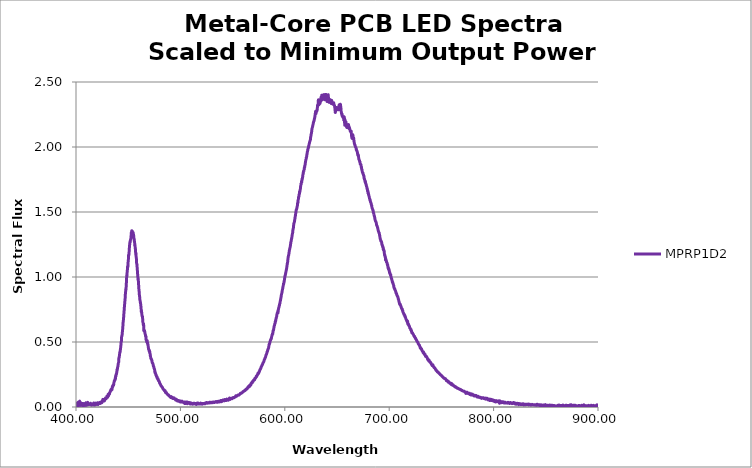
| Category | MPRP1D2 |
|---|---|
| 199.975 | 0 |
| 200.177 | 0 |
| 200.378 | 0 |
| 200.58 | 0 |
| 200.781 | 0 |
| 200.983 | 0 |
| 201.184 | 0 |
| 201.386 | 0 |
| 201.588 | 0 |
| 201.789 | 0 |
| 201.991 | 0 |
| 202.193 | 0 |
| 202.394 | 0 |
| 202.596 | 0 |
| 202.798 | 0 |
| 202.999 | 0 |
| 203.201 | 0 |
| 203.403 | 0 |
| 203.605 | 0 |
| 203.806 | 0 |
| 204.008 | 0 |
| 204.21 | 0 |
| 204.412 | 0 |
| 204.614 | 0 |
| 204.816 | 0 |
| 205.018 | 0 |
| 205.219 | 0 |
| 205.421 | 0 |
| 205.623 | 0 |
| 205.825 | 0 |
| 206.027 | 0 |
| 206.229 | 0 |
| 206.431 | 0 |
| 206.633 | 0 |
| 206.836 | 0 |
| 207.038 | 0 |
| 207.24 | 0 |
| 207.442 | 0 |
| 207.644 | 0 |
| 207.846 | 0 |
| 208.048 | 0 |
| 208.251 | 0 |
| 208.453 | 0 |
| 208.655 | 0 |
| 208.857 | 0 |
| 209.06 | 0 |
| 209.262 | 0 |
| 209.464 | 0 |
| 209.667 | 0 |
| 209.869 | 0 |
| 210.071 | 0 |
| 210.274 | 0 |
| 210.476 | 0 |
| 210.678 | 0 |
| 210.881 | 0 |
| 211.083 | 0 |
| 211.286 | 0 |
| 211.488 | 0 |
| 211.691 | 0 |
| 211.893 | 0 |
| 212.096 | 0 |
| 212.299 | 0 |
| 212.501 | 0 |
| 212.704 | 0 |
| 212.906 | 0 |
| 213.109 | 0 |
| 213.312 | 0 |
| 213.514 | 0 |
| 213.717 | 0 |
| 213.92 | 0 |
| 214.123 | 0 |
| 214.325 | 0 |
| 214.528 | 0 |
| 214.731 | 0 |
| 214.934 | 0 |
| 215.137 | 0 |
| 215.339 | 0 |
| 215.542 | 0 |
| 215.745 | 0 |
| 215.948 | 0 |
| 216.151 | 0 |
| 216.354 | 0 |
| 216.557 | 0 |
| 216.76 | 0 |
| 216.963 | 0 |
| 217.166 | 0 |
| 217.369 | 0 |
| 217.572 | 0 |
| 217.775 | 0 |
| 217.978 | 0 |
| 218.181 | 0 |
| 218.385 | 0 |
| 218.588 | 0 |
| 218.791 | 0 |
| 218.994 | 0 |
| 219.197 | 0 |
| 219.4 | 0 |
| 219.604 | 0 |
| 219.807 | 0 |
| 220.01 | 0 |
| 220.214 | 0 |
| 220.417 | 0 |
| 220.62 | 0 |
| 220.824 | 0 |
| 221.027 | 0 |
| 221.23 | 0 |
| 221.434 | 0 |
| 221.637 | 0 |
| 221.841 | 0 |
| 222.044 | 0 |
| 222.248 | 0 |
| 222.451 | 0 |
| 222.655 | 0 |
| 222.858 | 0 |
| 223.062 | 0 |
| 223.265 | 0 |
| 223.469 | 0 |
| 223.672 | 0 |
| 223.876 | 0 |
| 224.08 | 0 |
| 224.283 | 0 |
| 224.487 | 0 |
| 224.691 | 0 |
| 224.894 | 0 |
| 225.098 | 0 |
| 225.302 | 0 |
| 225.506 | 0 |
| 225.71 | 0 |
| 225.913 | 0 |
| 226.117 | 0 |
| 226.321 | 0 |
| 226.525 | 0 |
| 226.729 | 0 |
| 226.933 | 0 |
| 227.137 | 0 |
| 227.341 | 0 |
| 227.544 | 0 |
| 227.748 | 0 |
| 227.952 | 0 |
| 228.156 | 0 |
| 228.361 | 0 |
| 228.565 | 0 |
| 228.769 | 0 |
| 228.973 | 0 |
| 229.177 | 0 |
| 229.381 | 0 |
| 229.585 | 0 |
| 229.789 | 0 |
| 229.993 | 0 |
| 230.198 | 0 |
| 230.402 | 0 |
| 230.606 | 0 |
| 230.81 | 0 |
| 231.015 | 0 |
| 231.219 | 0 |
| 231.423 | 0 |
| 231.627 | 0 |
| 231.832 | 0 |
| 232.036 | 0 |
| 232.241 | 0 |
| 232.445 | 0 |
| 232.649 | 0 |
| 232.854 | 0 |
| 233.058 | 0 |
| 233.263 | 0 |
| 233.467 | 0 |
| 233.672 | 0 |
| 233.876 | 0 |
| 234.081 | 0 |
| 234.285 | 0 |
| 234.49 | 0 |
| 234.695 | 0 |
| 234.899 | 0 |
| 235.104 | 0 |
| 235.308 | 0 |
| 235.513 | 0 |
| 235.718 | 0 |
| 235.922 | 0 |
| 236.127 | 0 |
| 236.332 | 0 |
| 236.537 | 0 |
| 236.741 | 0 |
| 236.946 | 0 |
| 237.151 | 0 |
| 237.356 | 0 |
| 237.561 | 0 |
| 237.766 | 0 |
| 237.971 | 0 |
| 238.175 | 0 |
| 238.38 | 0 |
| 238.585 | 0 |
| 238.79 | 0 |
| 238.995 | 0 |
| 239.2 | 0 |
| 239.405 | 0 |
| 239.61 | 0 |
| 239.815 | 0 |
| 240.02 | 0 |
| 240.225 | 0 |
| 240.431 | 0 |
| 240.636 | 0 |
| 240.841 | 0 |
| 241.046 | 0 |
| 241.251 | 0 |
| 241.456 | 0 |
| 241.662 | 0 |
| 241.867 | 0 |
| 242.072 | 0 |
| 242.277 | 0 |
| 242.483 | 0 |
| 242.688 | 0 |
| 242.893 | 0 |
| 243.098 | 0 |
| 243.304 | 0 |
| 243.509 | 0 |
| 243.715 | 0 |
| 243.92 | 0 |
| 244.125 | 0 |
| 244.331 | 0 |
| 244.536 | 0 |
| 244.742 | 0 |
| 244.947 | 0 |
| 245.153 | 0 |
| 245.358 | 0 |
| 245.564 | 0 |
| 245.769 | 0 |
| 245.975 | 0 |
| 246.181 | 0 |
| 246.386 | 0 |
| 246.592 | 0 |
| 246.798 | 0 |
| 247.003 | 0 |
| 247.209 | 0 |
| 247.415 | 0 |
| 247.62 | 0 |
| 247.826 | 0 |
| 248.032 | 0 |
| 248.238 | 0 |
| 248.443 | 0 |
| 248.649 | 0 |
| 248.855 | 0 |
| 249.061 | 0 |
| 249.267 | 0 |
| 249.473 | 0 |
| 249.679 | 0 |
| 249.885 | 0 |
| 250.091 | 0 |
| 250.297 | 0 |
| 250.502 | 0 |
| 250.708 | 0 |
| 250.914 | 0 |
| 251.121 | 0 |
| 251.327 | 0 |
| 251.533 | 0 |
| 251.739 | 0 |
| 251.945 | 0 |
| 252.151 | 0 |
| 252.357 | 0 |
| 252.563 | 0 |
| 252.769 | 0 |
| 252.976 | 0 |
| 253.182 | 0 |
| 253.388 | 0 |
| 253.594 | 0 |
| 253.801 | 0 |
| 254.007 | 0 |
| 254.213 | 0 |
| 254.419 | 0 |
| 254.626 | 0 |
| 254.832 | 0 |
| 255.039 | 0 |
| 255.245 | 0 |
| 255.451 | 0 |
| 255.658 | 0 |
| 255.864 | 0 |
| 256.071 | 0 |
| 256.277 | 0 |
| 256.484 | 0 |
| 256.69 | 0 |
| 256.897 | 0 |
| 257.103 | 0 |
| 257.31 | 0 |
| 257.516 | 0 |
| 257.723 | 0 |
| 257.93 | 0 |
| 258.136 | 0 |
| 258.343 | 0 |
| 258.55 | 0 |
| 258.756 | 0 |
| 258.963 | 0 |
| 259.17 | 0 |
| 259.376 | 0 |
| 259.583 | 0 |
| 259.79 | 0 |
| 259.997 | 0 |
| 260.204 | 0 |
| 260.41 | 0 |
| 260.617 | 0 |
| 260.824 | 0 |
| 261.031 | 0 |
| 261.238 | 0 |
| 261.445 | 0 |
| 261.652 | 0 |
| 261.859 | 0 |
| 262.066 | 0 |
| 262.273 | 0 |
| 262.48 | 0 |
| 262.687 | 0 |
| 262.894 | 0 |
| 263.101 | 0 |
| 263.308 | 0 |
| 263.515 | 0 |
| 263.722 | 0 |
| 263.929 | 0 |
| 264.136 | 0 |
| 264.343 | 0 |
| 264.551 | 0 |
| 264.758 | 0 |
| 264.965 | 0 |
| 265.172 | 0 |
| 265.38 | 0 |
| 265.587 | 0 |
| 265.794 | 0 |
| 266.001 | 0 |
| 266.209 | 0 |
| 266.416 | 0 |
| 266.623 | 0 |
| 266.831 | 0 |
| 267.038 | 0 |
| 267.246 | 0 |
| 267.453 | 0 |
| 267.66 | 0 |
| 267.868 | 0 |
| 268.075 | 0 |
| 268.283 | 0 |
| 268.49 | 0 |
| 268.698 | 0 |
| 268.905 | 0 |
| 269.113 | 0 |
| 269.321 | 0 |
| 269.528 | 0 |
| 269.736 | 0 |
| 269.943 | 0 |
| 270.151 | 0 |
| 270.359 | 0 |
| 270.567 | 0 |
| 270.774 | 0 |
| 270.982 | 0 |
| 271.19 | 0 |
| 271.397 | 0 |
| 271.605 | 0 |
| 271.813 | 0 |
| 272.021 | 0 |
| 272.229 | 0 |
| 272.436 | 0 |
| 272.644 | 0 |
| 272.852 | 0 |
| 273.06 | 0 |
| 273.268 | 0 |
| 273.476 | 0 |
| 273.684 | 0 |
| 273.892 | 0 |
| 274.1 | 0 |
| 274.308 | 0 |
| 274.516 | 0 |
| 274.724 | 0 |
| 274.932 | 0 |
| 275.14 | 0 |
| 275.348 | 0 |
| 275.556 | 0 |
| 275.764 | 0 |
| 275.973 | 0 |
| 276.181 | 0 |
| 276.389 | 0 |
| 276.597 | 0 |
| 276.805 | 0 |
| 277.013 | 0 |
| 277.222 | 0 |
| 277.43 | 0 |
| 277.638 | 0 |
| 277.847 | 0 |
| 278.055 | 0 |
| 278.263 | 0 |
| 278.472 | 0 |
| 278.68 | 0 |
| 278.888 | 0 |
| 279.097 | 0 |
| 279.305 | 0 |
| 279.514 | 0 |
| 279.722 | 0 |
| 279.93 | 0 |
| 280.139 | 0 |
| 280.347 | 0 |
| 280.556 | 0 |
| 280.764 | 0 |
| 280.973 | 0 |
| 281.182 | 0 |
| 281.39 | 0 |
| 281.599 | 0 |
| 281.807 | 0 |
| 282.016 | 0 |
| 282.225 | 0 |
| 282.433 | 0 |
| 282.642 | 0 |
| 282.851 | 0 |
| 283.06 | 0 |
| 283.268 | 0 |
| 283.477 | 0 |
| 283.686 | 0 |
| 283.895 | 0 |
| 284.103 | 0 |
| 284.312 | 0 |
| 284.521 | 0 |
| 284.73 | 0 |
| 284.939 | 0 |
| 285.148 | 0 |
| 285.357 | 0 |
| 285.566 | 0 |
| 285.775 | 0 |
| 285.984 | 0 |
| 286.193 | 0 |
| 286.402 | 0 |
| 286.611 | 0 |
| 286.82 | 0 |
| 287.029 | 0 |
| 287.238 | 0 |
| 287.447 | 0 |
| 287.656 | 0 |
| 287.865 | 0 |
| 288.074 | 0 |
| 288.283 | 0 |
| 288.492 | 0 |
| 288.702 | 0 |
| 288.911 | 0 |
| 289.12 | 0 |
| 289.329 | 0 |
| 289.539 | 0 |
| 289.748 | 0 |
| 289.957 | 0 |
| 290.166 | 0 |
| 290.376 | 0 |
| 290.585 | 0 |
| 290.795 | 0 |
| 291.004 | 0 |
| 291.213 | 0 |
| 291.423 | 0 |
| 291.632 | 0 |
| 291.842 | 0 |
| 292.051 | 0 |
| 292.26 | 0 |
| 292.47 | 0 |
| 292.68 | 0 |
| 292.889 | 0 |
| 293.099 | 0 |
| 293.308 | 0 |
| 293.518 | 0 |
| 293.727 | 0 |
| 293.937 | 0 |
| 294.147 | 0 |
| 294.356 | 0 |
| 294.566 | 0 |
| 294.776 | 0 |
| 294.985 | 0 |
| 295.195 | 0 |
| 295.405 | 0 |
| 295.614 | 0 |
| 295.824 | 0 |
| 296.034 | 0 |
| 296.244 | 0 |
| 296.454 | 0 |
| 296.663 | 0 |
| 296.873 | 0 |
| 297.083 | 0 |
| 297.293 | 0 |
| 297.503 | 0 |
| 297.713 | 0 |
| 297.923 | 0 |
| 298.133 | 0 |
| 298.343 | 0 |
| 298.553 | 0 |
| 298.763 | 0 |
| 298.973 | 0 |
| 299.183 | 0 |
| 299.393 | 0 |
| 299.603 | 0 |
| 299.813 | 0 |
| 300.023 | 0 |
| 300.233 | 0 |
| 300.443 | 0 |
| 300.654 | 0 |
| 300.864 | 0 |
| 301.074 | 0 |
| 301.284 | 0 |
| 301.494 | 0 |
| 301.705 | 0 |
| 301.915 | 0 |
| 302.125 | 0 |
| 302.335 | 0 |
| 302.546 | 0 |
| 302.756 | 0 |
| 302.966 | 0 |
| 303.177 | 0 |
| 303.387 | 0 |
| 303.598 | 0 |
| 303.808 | 0 |
| 304.018 | 0 |
| 304.229 | 0 |
| 304.439 | 0 |
| 304.65 | 0 |
| 304.86 | 0 |
| 305.071 | 0 |
| 305.281 | 0 |
| 305.492 | 0 |
| 305.702 | 0 |
| 305.913 | 0 |
| 306.124 | 0 |
| 306.334 | 0 |
| 306.545 | 0 |
| 306.755 | 0 |
| 306.966 | 0 |
| 307.177 | 0 |
| 307.387 | 0 |
| 307.598 | 0 |
| 307.809 | 0 |
| 308.02 | 0 |
| 308.23 | 0 |
| 308.441 | 0 |
| 308.652 | 0 |
| 308.863 | 0 |
| 309.074 | 0 |
| 309.284 | 0 |
| 309.495 | 0 |
| 309.706 | 0 |
| 309.917 | 0 |
| 310.128 | 0 |
| 310.339 | 0 |
| 310.55 | 0 |
| 310.761 | 0 |
| 310.972 | 0 |
| 311.183 | 0 |
| 311.394 | 0 |
| 311.605 | 0 |
| 311.816 | 0 |
| 312.027 | 0 |
| 312.238 | 0 |
| 312.449 | 0 |
| 312.66 | 0 |
| 312.871 | 0 |
| 313.083 | 0 |
| 313.294 | 0 |
| 313.505 | 0 |
| 313.716 | 0 |
| 313.927 | 0 |
| 314.139 | 0 |
| 314.35 | 0 |
| 314.561 | 0 |
| 314.772 | 0 |
| 314.984 | 0 |
| 315.195 | 0 |
| 315.406 | 0 |
| 315.618 | 0 |
| 315.829 | 0 |
| 316.04 | 0 |
| 316.252 | 0 |
| 316.463 | 0 |
| 316.675 | 0 |
| 316.886 | 0 |
| 317.097 | 0 |
| 317.309 | 0 |
| 317.52 | 0 |
| 317.732 | 0 |
| 317.943 | 0 |
| 318.155 | 0 |
| 318.367 | 0 |
| 318.578 | 0 |
| 318.79 | 0 |
| 319.001 | 0 |
| 319.213 | 0 |
| 319.425 | 0 |
| 319.636 | 0 |
| 319.848 | 0 |
| 320.06 | 0 |
| 320.271 | 0 |
| 320.483 | 0 |
| 320.695 | 0 |
| 320.907 | 0 |
| 321.118 | 0 |
| 321.33 | 0 |
| 321.542 | 0 |
| 321.754 | 0 |
| 321.966 | 0 |
| 322.177 | 0 |
| 322.389 | 0 |
| 322.601 | 0 |
| 322.813 | 0 |
| 323.025 | 0 |
| 323.237 | 0 |
| 323.449 | 0 |
| 323.661 | 0 |
| 323.873 | 0 |
| 324.085 | 0 |
| 324.297 | 0 |
| 324.509 | 0 |
| 324.721 | 0 |
| 324.933 | 0 |
| 325.145 | 0 |
| 325.357 | 0 |
| 325.569 | 0 |
| 325.781 | 0 |
| 325.994 | 0 |
| 326.206 | 0 |
| 326.418 | 0 |
| 326.63 | 0 |
| 326.842 | 0 |
| 327.055 | 0 |
| 327.267 | 0 |
| 327.479 | 0 |
| 327.691 | 0 |
| 327.904 | 0 |
| 328.116 | 0 |
| 328.328 | 0 |
| 328.541 | 0 |
| 328.753 | 0 |
| 328.965 | 0 |
| 329.178 | 0 |
| 329.39 | 0 |
| 329.603 | 0 |
| 329.815 | 0 |
| 330.028 | 0 |
| 330.24 | 0 |
| 330.453 | 0 |
| 330.665 | 0 |
| 330.878 | 0 |
| 331.09 | 0 |
| 331.303 | 0 |
| 331.515 | 0 |
| 331.728 | 0 |
| 331.94 | 0 |
| 332.153 | 0 |
| 332.366 | 0 |
| 332.578 | 0 |
| 332.791 | 0 |
| 333.004 | 0 |
| 333.216 | 0 |
| 333.429 | 0 |
| 333.642 | 0 |
| 333.855 | 0 |
| 334.067 | 0 |
| 334.28 | 0 |
| 334.493 | 0 |
| 334.706 | 0 |
| 334.919 | 0 |
| 335.132 | 0 |
| 335.344 | 0 |
| 335.557 | 0 |
| 335.77 | 0 |
| 335.983 | 0 |
| 336.196 | 0 |
| 336.409 | 0 |
| 336.622 | 0 |
| 336.835 | 0 |
| 337.048 | 0 |
| 337.261 | 0 |
| 337.474 | 0 |
| 337.687 | 0 |
| 337.9 | 0 |
| 338.113 | 0 |
| 338.326 | 0 |
| 338.539 | 0 |
| 338.752 | 0 |
| 338.966 | 0 |
| 339.179 | 0 |
| 339.392 | 0 |
| 339.605 | 0 |
| 339.818 | 0 |
| 340.032 | 0 |
| 340.245 | 0 |
| 340.458 | 0 |
| 340.671 | 0 |
| 340.885 | 0 |
| 341.098 | 0 |
| 341.311 | 0 |
| 341.525 | 0 |
| 341.738 | 0 |
| 341.951 | 0 |
| 342.165 | 0 |
| 342.378 | 0 |
| 342.591 | 0 |
| 342.805 | 0 |
| 343.018 | 0 |
| 343.232 | 0 |
| 343.445 | 0 |
| 343.659 | 0 |
| 343.872 | 0 |
| 344.086 | 0 |
| 344.299 | 0 |
| 344.513 | 0 |
| 344.727 | 0 |
| 344.94 | 0 |
| 345.154 | 0 |
| 345.367 | 0 |
| 345.581 | 0 |
| 345.795 | 0 |
| 346.008 | 0 |
| 346.222 | 0 |
| 346.436 | 0 |
| 346.649 | 0 |
| 346.863 | 0 |
| 347.077 | 0 |
| 347.291 | 0 |
| 347.504 | 0 |
| 347.718 | 0 |
| 347.932 | 0 |
| 348.146 | 0 |
| 348.36 | 0 |
| 348.574 | 0 |
| 348.787 | 0 |
| 349.001 | 0 |
| 349.215 | 0 |
| 349.429 | 0 |
| 349.643 | 0 |
| 349.857 | 0 |
| 350.071 | 0 |
| 350.285 | 0 |
| 350.499 | 0 |
| 350.713 | 0 |
| 350.927 | 0 |
| 351.141 | 0 |
| 351.355 | 0 |
| 351.569 | 0 |
| 351.783 | 0 |
| 351.998 | 0 |
| 352.212 | 0 |
| 352.426 | 0 |
| 352.64 | 0 |
| 352.854 | 0 |
| 353.068 | 0 |
| 353.283 | 0 |
| 353.497 | 0 |
| 353.711 | 0 |
| 353.925 | 0 |
| 354.14 | 0 |
| 354.354 | 0 |
| 354.568 | 0 |
| 354.783 | 0 |
| 354.997 | 0 |
| 355.211 | 0 |
| 355.426 | 0 |
| 355.64 | 0 |
| 355.854 | 0 |
| 356.069 | 0 |
| 356.283 | 0 |
| 356.498 | 0 |
| 356.712 | 0 |
| 356.927 | 0 |
| 357.141 | 0 |
| 357.356 | 0 |
| 357.57 | 0 |
| 357.785 | 0 |
| 357.999 | 0 |
| 358.214 | 0 |
| 358.429 | 0 |
| 358.643 | 0 |
| 358.858 | 0 |
| 359.072 | 0 |
| 359.287 | 0 |
| 359.502 | 0 |
| 359.716 | 0 |
| 359.931 | 0 |
| 360.146 | 0 |
| 360.361 | 0 |
| 360.575 | 0 |
| 360.79 | 0 |
| 361.005 | 0 |
| 361.22 | 0 |
| 361.434 | 0 |
| 361.649 | 0 |
| 361.864 | 0 |
| 362.079 | 0 |
| 362.294 | 0 |
| 362.509 | 0 |
| 362.724 | 0 |
| 362.939 | 0 |
| 363.154 | 0 |
| 363.369 | 0 |
| 363.583 | 0 |
| 363.798 | 0 |
| 364.013 | 0 |
| 364.228 | 0 |
| 364.444 | 0 |
| 364.659 | 0 |
| 364.874 | 0 |
| 365.089 | 0 |
| 365.304 | 0 |
| 365.519 | 0 |
| 365.734 | 0 |
| 365.949 | 0 |
| 366.164 | 0 |
| 366.38 | 0 |
| 366.595 | 0 |
| 366.81 | 0 |
| 367.025 | 0 |
| 367.24 | 0 |
| 367.456 | 0 |
| 367.671 | 0 |
| 367.886 | 0 |
| 368.101 | 0 |
| 368.317 | 0 |
| 368.532 | 0 |
| 368.747 | 0 |
| 368.963 | 0 |
| 369.178 | 0 |
| 369.394 | 0 |
| 369.609 | 0 |
| 369.824 | 0 |
| 370.04 | 0 |
| 370.255 | 0 |
| 370.471 | 0 |
| 370.686 | 0 |
| 370.902 | 0 |
| 371.117 | 0 |
| 371.333 | 0 |
| 371.548 | 0 |
| 371.764 | 0 |
| 371.98 | 0 |
| 372.195 | 0 |
| 372.411 | 0 |
| 372.626 | 0 |
| 372.842 | 0 |
| 373.058 | 0 |
| 373.273 | 0 |
| 373.489 | 0 |
| 373.705 | 0 |
| 373.92 | 0 |
| 374.136 | 0 |
| 374.352 | 0 |
| 374.568 | 0 |
| 374.783 | 0 |
| 374.999 | 0 |
| 375.215 | 0 |
| 375.431 | 0 |
| 375.647 | 0 |
| 375.863 | 0 |
| 376.078 | 0 |
| 376.294 | 0 |
| 376.51 | 0 |
| 376.726 | 0 |
| 376.942 | 0 |
| 377.158 | 0 |
| 377.374 | 0 |
| 377.59 | 0 |
| 377.806 | 0 |
| 378.022 | 0 |
| 378.238 | 0 |
| 378.454 | 0 |
| 378.67 | 0 |
| 378.886 | 0 |
| 379.102 | 0 |
| 379.318 | 0 |
| 379.535 | 0 |
| 379.751 | 0 |
| 379.967 | 0 |
| 380.183 | 0 |
| 380.399 | 0 |
| 380.615 | 0 |
| 380.832 | 0 |
| 381.048 | 0 |
| 381.264 | 0 |
| 381.48 | 0 |
| 381.697 | 0 |
| 381.913 | 0 |
| 382.129 | 0 |
| 382.346 | 0 |
| 382.562 | 0 |
| 382.778 | 0 |
| 382.995 | 0 |
| 383.211 | 0 |
| 383.427 | 0 |
| 383.644 | 0 |
| 383.86 | 0 |
| 384.077 | 0.004 |
| 384.293 | 0.023 |
| 384.51 | 0.027 |
| 384.726 | 0.038 |
| 384.943 | 0.049 |
| 385.159 | 0.044 |
| 385.376 | 0.035 |
| 385.592 | 0.032 |
| 385.809 | 0.045 |
| 386.025 | 0.04 |
| 386.242 | 0.043 |
| 386.458 | 0.033 |
| 386.675 | 0.052 |
| 386.892 | 0.02 |
| 387.108 | 0.026 |
| 387.325 | 0.027 |
| 387.542 | 0.027 |
| 387.758 | 0.02 |
| 387.975 | 0.027 |
| 388.192 | 0.032 |
| 388.409 | 0.024 |
| 388.625 | 0.037 |
| 388.842 | 0.029 |
| 389.059 | 0.017 |
| 389.276 | 0.042 |
| 389.493 | 0.02 |
| 389.709 | 0.028 |
| 389.926 | 0.024 |
| 390.143 | 0.038 |
| 390.36 | 0.031 |
| 390.577 | 0.028 |
| 390.794 | 0.007 |
| 391.011 | 0.024 |
| 391.228 | 0.033 |
| 391.445 | 0.032 |
| 391.662 | 0.007 |
| 391.879 | 0.03 |
| 392.096 | 0.015 |
| 392.313 | 0.02 |
| 392.53 | 0.025 |
| 392.747 | 0.021 |
| 392.964 | 0.014 |
| 393.181 | 0.025 |
| 393.398 | 0.025 |
| 393.615 | 0.015 |
| 393.832 | 0.015 |
| 394.049 | 0.023 |
| 394.267 | 0.017 |
| 394.484 | 0.016 |
| 394.701 | 0.013 |
| 394.918 | 0.018 |
| 395.135 | 0.008 |
| 395.353 | 0.006 |
| 395.57 | 0.033 |
| 395.787 | 0.037 |
| 396.004 | 0.018 |
| 396.222 | 0.013 |
| 396.439 | 0.01 |
| 396.656 | 0.009 |
| 396.874 | 0.033 |
| 397.091 | 0.01 |
| 397.308 | 0.019 |
| 397.526 | 0.015 |
| 397.743 | 0.023 |
| 397.96 | 0.015 |
| 398.178 | 0.012 |
| 398.395 | 0.013 |
| 398.613 | 0.014 |
| 398.83 | 0.009 |
| 399.048 | 0.023 |
| 399.265 | 0.026 |
| 399.483 | 0.004 |
| 399.7 | 0.013 |
| 399.918 | 0.012 |
| 400.135 | 0.027 |
| 400.353 | 0.022 |
| 400.571 | 0.018 |
| 400.788 | 0.018 |
| 401.006 | 0.03 |
| 401.223 | -0.003 |
| 401.441 | 0.024 |
| 401.659 | 0.014 |
| 401.876 | 0.021 |
| 402.094 | 0.017 |
| 402.312 | 0.038 |
| 402.53 | 0.012 |
| 402.747 | 0.031 |
| 402.965 | 0.029 |
| 403.183 | 0.034 |
| 403.401 | 0.014 |
| 403.618 | 0.045 |
| 403.836 | 0.012 |
| 404.054 | 0.024 |
| 404.272 | 0.013 |
| 404.49 | 0.025 |
| 404.708 | 0.021 |
| 404.926 | 0.031 |
| 405.144 | 0.023 |
| 405.361 | 0.027 |
| 405.579 | 0.018 |
| 405.797 | 0.016 |
| 406.015 | 0.011 |
| 406.233 | 0.026 |
| 406.451 | 0.015 |
| 406.669 | 0.027 |
| 406.887 | 0.023 |
| 407.105 | 0.024 |
| 407.323 | 0.011 |
| 407.541 | 0.017 |
| 407.76 | 0.018 |
| 407.978 | 0.019 |
| 408.196 | 0.012 |
| 408.414 | 0.022 |
| 408.632 | 0.028 |
| 408.85 | 0.023 |
| 409.068 | 0.014 |
| 409.287 | 0.013 |
| 409.505 | 0.033 |
| 409.723 | 0.017 |
| 409.941 | 0.022 |
| 410.159 | 0.014 |
| 410.378 | 0.025 |
| 410.596 | 0.021 |
| 410.814 | 0.028 |
| 411.033 | 0.018 |
| 411.251 | 0.037 |
| 411.469 | 0.017 |
| 411.688 | 0.024 |
| 411.906 | 0.02 |
| 412.124 | 0.022 |
| 412.343 | 0.022 |
| 412.561 | 0.021 |
| 412.78 | 0.009 |
| 412.998 | 0.017 |
| 413.216 | 0.017 |
| 413.435 | 0.021 |
| 413.653 | 0.019 |
| 413.872 | 0.029 |
| 414.09 | 0.025 |
| 414.309 | 0.025 |
| 414.528 | 0.018 |
| 414.746 | 0.023 |
| 414.965 | 0.015 |
| 415.183 | 0.019 |
| 415.402 | 0.022 |
| 415.62 | 0.018 |
| 415.839 | 0.017 |
| 416.058 | 0.02 |
| 416.276 | 0.018 |
| 416.495 | 0.017 |
| 416.714 | 0.017 |
| 416.932 | 0.031 |
| 417.151 | 0.023 |
| 417.37 | 0.025 |
| 417.589 | 0.018 |
| 417.807 | 0.015 |
| 418.026 | 0.02 |
| 418.245 | 0.026 |
| 418.464 | 0.02 |
| 418.683 | 0.03 |
| 418.901 | 0.018 |
| 419.12 | 0.021 |
| 419.339 | 0.021 |
| 419.558 | 0.022 |
| 419.777 | 0.026 |
| 419.996 | 0.026 |
| 420.215 | 0.021 |
| 420.434 | 0.029 |
| 420.653 | 0.032 |
| 420.872 | 0.027 |
| 421.091 | 0.019 |
| 421.31 | 0.03 |
| 421.529 | 0.026 |
| 421.748 | 0.025 |
| 421.967 | 0.028 |
| 422.186 | 0.034 |
| 422.405 | 0.028 |
| 422.624 | 0.03 |
| 422.843 | 0.03 |
| 423.062 | 0.036 |
| 423.281 | 0.027 |
| 423.5 | 0.033 |
| 423.72 | 0.031 |
| 423.939 | 0.036 |
| 424.158 | 0.034 |
| 424.377 | 0.041 |
| 424.596 | 0.036 |
| 424.816 | 0.033 |
| 425.035 | 0.042 |
| 425.254 | 0.044 |
| 425.473 | 0.05 |
| 425.693 | 0.059 |
| 425.912 | 0.053 |
| 426.131 | 0.046 |
| 426.351 | 0.051 |
| 426.57 | 0.056 |
| 426.789 | 0.049 |
| 427.009 | 0.049 |
| 427.228 | 0.047 |
| 427.448 | 0.06 |
| 427.667 | 0.054 |
| 427.886 | 0.062 |
| 428.106 | 0.059 |
| 428.325 | 0.07 |
| 428.545 | 0.065 |
| 428.764 | 0.068 |
| 428.984 | 0.065 |
| 429.203 | 0.071 |
| 429.423 | 0.072 |
| 429.642 | 0.083 |
| 429.862 | 0.079 |
| 430.082 | 0.074 |
| 430.301 | 0.075 |
| 430.521 | 0.081 |
| 430.74 | 0.094 |
| 430.96 | 0.098 |
| 431.18 | 0.085 |
| 431.399 | 0.098 |
| 431.619 | 0.098 |
| 431.839 | 0.106 |
| 432.058 | 0.1 |
| 432.278 | 0.11 |
| 432.498 | 0.113 |
| 432.718 | 0.119 |
| 432.937 | 0.119 |
| 433.157 | 0.128 |
| 433.377 | 0.125 |
| 433.597 | 0.136 |
| 433.817 | 0.137 |
| 434.036 | 0.139 |
| 434.256 | 0.139 |
| 434.476 | 0.134 |
| 434.696 | 0.149 |
| 434.916 | 0.16 |
| 435.136 | 0.155 |
| 435.356 | 0.166 |
| 435.576 | 0.169 |
| 435.796 | 0.171 |
| 436.016 | 0.168 |
| 436.236 | 0.185 |
| 436.456 | 0.19 |
| 436.676 | 0.201 |
| 436.896 | 0.204 |
| 437.116 | 0.204 |
| 437.336 | 0.207 |
| 437.556 | 0.221 |
| 437.776 | 0.217 |
| 437.996 | 0.239 |
| 438.216 | 0.237 |
| 438.436 | 0.251 |
| 438.656 | 0.251 |
| 438.877 | 0.26 |
| 439.097 | 0.268 |
| 439.317 | 0.29 |
| 439.537 | 0.286 |
| 439.757 | 0.3 |
| 439.978 | 0.309 |
| 440.198 | 0.314 |
| 440.418 | 0.33 |
| 440.638 | 0.34 |
| 440.859 | 0.345 |
| 441.079 | 0.376 |
| 441.299 | 0.379 |
| 441.519 | 0.391 |
| 441.74 | 0.405 |
| 441.96 | 0.422 |
| 442.181 | 0.421 |
| 442.401 | 0.435 |
| 442.621 | 0.448 |
| 442.842 | 0.462 |
| 443.062 | 0.48 |
| 443.283 | 0.503 |
| 443.503 | 0.506 |
| 443.724 | 0.542 |
| 443.944 | 0.545 |
| 444.164 | 0.555 |
| 444.385 | 0.575 |
| 444.606 | 0.591 |
| 444.826 | 0.61 |
| 445.047 | 0.641 |
| 445.267 | 0.66 |
| 445.488 | 0.675 |
| 445.708 | 0.7 |
| 445.929 | 0.726 |
| 446.15 | 0.746 |
| 446.37 | 0.772 |
| 446.591 | 0.791 |
| 446.812 | 0.813 |
| 447.032 | 0.831 |
| 447.253 | 0.865 |
| 447.474 | 0.881 |
| 447.694 | 0.906 |
| 447.915 | 0.907 |
| 448.136 | 0.942 |
| 448.357 | 0.967 |
| 448.577 | 1.01 |
| 448.798 | 1.009 |
| 449.019 | 1.041 |
| 449.24 | 1.057 |
| 449.461 | 1.083 |
| 449.682 | 1.078 |
| 449.902 | 1.113 |
| 450.123 | 1.125 |
| 450.344 | 1.167 |
| 450.565 | 1.166 |
| 450.786 | 1.186 |
| 451.007 | 1.205 |
| 451.228 | 1.241 |
| 451.449 | 1.25 |
| 451.67 | 1.27 |
| 451.891 | 1.269 |
| 452.112 | 1.283 |
| 452.333 | 1.287 |
| 452.554 | 1.296 |
| 452.775 | 1.316 |
| 452.996 | 1.34 |
| 453.217 | 1.346 |
| 453.438 | 1.356 |
| 453.659 | 1.353 |
| 453.88 | 1.353 |
| 454.101 | 1.344 |
| 454.323 | 1.325 |
| 454.544 | 1.339 |
| 454.765 | 1.34 |
| 454.986 | 1.328 |
| 455.207 | 1.319 |
| 455.429 | 1.299 |
| 455.65 | 1.295 |
| 455.871 | 1.275 |
| 456.092 | 1.272 |
| 456.314 | 1.243 |
| 456.535 | 1.244 |
| 456.756 | 1.217 |
| 456.977 | 1.213 |
| 457.199 | 1.176 |
| 457.42 | 1.183 |
| 457.641 | 1.151 |
| 457.863 | 1.14 |
| 458.084 | 1.104 |
| 458.306 | 1.101 |
| 458.527 | 1.078 |
| 458.748 | 1.056 |
| 458.97 | 1.028 |
| 459.191 | 1.009 |
| 459.413 | 0.98 |
| 459.634 | 0.985 |
| 459.856 | 0.95 |
| 460.077 | 0.931 |
| 460.299 | 0.898 |
| 460.52 | 0.886 |
| 460.742 | 0.859 |
| 460.963 | 0.848 |
| 461.185 | 0.826 |
| 461.407 | 0.818 |
| 461.628 | 0.805 |
| 461.85 | 0.798 |
| 462.071 | 0.779 |
| 462.293 | 0.77 |
| 462.515 | 0.732 |
| 462.736 | 0.74 |
| 462.958 | 0.723 |
| 463.18 | 0.706 |
| 463.402 | 0.698 |
| 463.623 | 0.698 |
| 463.845 | 0.678 |
| 464.067 | 0.651 |
| 464.289 | 0.646 |
| 464.51 | 0.63 |
| 464.732 | 0.639 |
| 464.954 | 0.59 |
| 465.176 | 0.59 |
| 465.398 | 0.583 |
| 465.619 | 0.588 |
| 465.841 | 0.577 |
| 466.063 | 0.568 |
| 466.285 | 0.56 |
| 466.507 | 0.555 |
| 466.729 | 0.543 |
| 466.951 | 0.543 |
| 467.173 | 0.516 |
| 467.395 | 0.515 |
| 467.617 | 0.506 |
| 467.839 | 0.5 |
| 468.061 | 0.509 |
| 468.283 | 0.508 |
| 468.505 | 0.487 |
| 468.727 | 0.489 |
| 468.949 | 0.477 |
| 469.171 | 0.465 |
| 469.393 | 0.453 |
| 469.615 | 0.441 |
| 469.837 | 0.441 |
| 470.059 | 0.44 |
| 470.282 | 0.425 |
| 470.504 | 0.431 |
| 470.726 | 0.415 |
| 470.948 | 0.413 |
| 471.17 | 0.395 |
| 471.393 | 0.391 |
| 471.615 | 0.374 |
| 471.837 | 0.372 |
| 472.059 | 0.368 |
| 472.282 | 0.368 |
| 472.504 | 0.362 |
| 472.726 | 0.357 |
| 472.948 | 0.344 |
| 473.171 | 0.339 |
| 473.393 | 0.339 |
| 473.615 | 0.332 |
| 473.838 | 0.329 |
| 474.06 | 0.316 |
| 474.283 | 0.313 |
| 474.505 | 0.309 |
| 474.727 | 0.299 |
| 474.95 | 0.295 |
| 475.172 | 0.291 |
| 475.395 | 0.281 |
| 475.617 | 0.265 |
| 475.84 | 0.269 |
| 476.062 | 0.261 |
| 476.285 | 0.255 |
| 476.507 | 0.246 |
| 476.73 | 0.249 |
| 476.952 | 0.238 |
| 477.175 | 0.234 |
| 477.397 | 0.229 |
| 477.62 | 0.233 |
| 477.843 | 0.222 |
| 478.065 | 0.218 |
| 478.288 | 0.215 |
| 478.511 | 0.218 |
| 478.733 | 0.207 |
| 478.956 | 0.206 |
| 479.179 | 0.2 |
| 479.401 | 0.202 |
| 479.624 | 0.196 |
| 479.847 | 0.194 |
| 480.069 | 0.185 |
| 480.292 | 0.182 |
| 480.515 | 0.179 |
| 480.738 | 0.178 |
| 480.961 | 0.171 |
| 481.183 | 0.168 |
| 481.406 | 0.164 |
| 481.629 | 0.162 |
| 481.852 | 0.161 |
| 482.075 | 0.157 |
| 482.298 | 0.154 |
| 482.521 | 0.152 |
| 482.743 | 0.152 |
| 482.966 | 0.148 |
| 483.189 | 0.141 |
| 483.412 | 0.14 |
| 483.635 | 0.137 |
| 483.858 | 0.134 |
| 484.081 | 0.132 |
| 484.304 | 0.132 |
| 484.527 | 0.127 |
| 484.75 | 0.13 |
| 484.973 | 0.126 |
| 485.196 | 0.125 |
| 485.419 | 0.125 |
| 485.642 | 0.114 |
| 485.866 | 0.11 |
| 486.089 | 0.113 |
| 486.312 | 0.112 |
| 486.535 | 0.111 |
| 486.758 | 0.108 |
| 486.981 | 0.104 |
| 487.204 | 0.101 |
| 487.428 | 0.101 |
| 487.651 | 0.096 |
| 487.874 | 0.095 |
| 488.097 | 0.095 |
| 488.32 | 0.093 |
| 488.544 | 0.094 |
| 488.767 | 0.092 |
| 488.99 | 0.087 |
| 489.214 | 0.084 |
| 489.437 | 0.085 |
| 489.66 | 0.083 |
| 489.884 | 0.079 |
| 490.107 | 0.078 |
| 490.33 | 0.076 |
| 490.554 | 0.074 |
| 490.777 | 0.073 |
| 491.0 | 0.076 |
| 491.224 | 0.08 |
| 491.447 | 0.076 |
| 491.671 | 0.077 |
| 491.894 | 0.076 |
| 492.118 | 0.072 |
| 492.341 | 0.068 |
| 492.565 | 0.066 |
| 492.788 | 0.07 |
| 493.012 | 0.071 |
| 493.235 | 0.065 |
| 493.459 | 0.066 |
| 493.682 | 0.067 |
| 493.906 | 0.07 |
| 494.129 | 0.066 |
| 494.353 | 0.062 |
| 494.577 | 0.062 |
| 494.8 | 0.062 |
| 495.024 | 0.062 |
| 495.248 | 0.056 |
| 495.471 | 0.053 |
| 495.695 | 0.056 |
| 495.919 | 0.058 |
| 496.142 | 0.06 |
| 496.366 | 0.053 |
| 496.59 | 0.054 |
| 496.814 | 0.05 |
| 497.037 | 0.047 |
| 497.261 | 0.051 |
| 497.485 | 0.049 |
| 497.709 | 0.046 |
| 497.932 | 0.047 |
| 498.156 | 0.046 |
| 498.38 | 0.049 |
| 498.604 | 0.044 |
| 498.828 | 0.044 |
| 499.052 | 0.047 |
| 499.276 | 0.048 |
| 499.5 | 0.044 |
| 499.723 | 0.045 |
| 499.947 | 0.038 |
| 500.171 | 0.045 |
| 500.395 | 0.041 |
| 500.619 | 0.044 |
| 500.843 | 0.039 |
| 501.067 | 0.044 |
| 501.291 | 0.039 |
| 501.515 | 0.046 |
| 501.739 | 0.039 |
| 501.963 | 0.041 |
| 502.187 | 0.037 |
| 502.412 | 0.039 |
| 502.636 | 0.036 |
| 502.86 | 0.037 |
| 503.084 | 0.037 |
| 503.308 | 0.037 |
| 503.532 | 0.033 |
| 503.756 | 0.038 |
| 503.98 | 0.027 |
| 504.205 | 0.036 |
| 504.429 | 0.037 |
| 504.653 | 0.037 |
| 504.877 | 0.027 |
| 505.101 | 0.034 |
| 505.326 | 0.029 |
| 505.55 | 0.035 |
| 505.774 | 0.034 |
| 505.999 | 0.029 |
| 506.223 | 0.039 |
| 506.447 | 0.036 |
| 506.672 | 0.025 |
| 506.896 | 0.037 |
| 507.12 | 0.028 |
| 507.345 | 0.03 |
| 507.569 | 0.029 |
| 507.793 | 0.033 |
| 508.018 | 0.032 |
| 508.242 | 0.035 |
| 508.467 | 0.031 |
| 508.691 | 0.028 |
| 508.916 | 0.026 |
| 509.14 | 0.027 |
| 509.364 | 0.023 |
| 509.589 | 0.033 |
| 509.813 | 0.031 |
| 510.038 | 0.026 |
| 510.263 | 0.024 |
| 510.487 | 0.027 |
| 510.712 | 0.029 |
| 510.936 | 0.027 |
| 511.161 | 0.023 |
| 511.385 | 0.027 |
| 511.61 | 0.026 |
| 511.835 | 0.022 |
| 512.059 | 0.024 |
| 512.284 | 0.024 |
| 512.509 | 0.024 |
| 512.733 | 0.026 |
| 512.958 | 0.03 |
| 513.183 | 0.028 |
| 513.407 | 0.024 |
| 513.632 | 0.027 |
| 513.857 | 0.024 |
| 514.082 | 0.023 |
| 514.306 | 0.027 |
| 514.531 | 0.025 |
| 514.756 | 0.026 |
| 514.981 | 0.023 |
| 515.206 | 0.02 |
| 515.43 | 0.028 |
| 515.655 | 0.027 |
| 515.88 | 0.026 |
| 516.105 | 0.024 |
| 516.33 | 0.024 |
| 516.555 | 0.023 |
| 516.78 | 0.032 |
| 517.005 | 0.024 |
| 517.23 | 0.026 |
| 517.455 | 0.024 |
| 517.679 | 0.023 |
| 517.904 | 0.023 |
| 518.129 | 0.025 |
| 518.354 | 0.026 |
| 518.579 | 0.026 |
| 518.804 | 0.023 |
| 519.03 | 0.024 |
| 519.255 | 0.028 |
| 519.48 | 0.03 |
| 519.705 | 0.026 |
| 519.93 | 0.023 |
| 520.155 | 0.023 |
| 520.38 | 0.028 |
| 520.605 | 0.024 |
| 520.83 | 0.022 |
| 521.055 | 0.026 |
| 521.281 | 0.024 |
| 521.506 | 0.027 |
| 521.731 | 0.026 |
| 521.956 | 0.025 |
| 522.181 | 0.027 |
| 522.407 | 0.027 |
| 522.632 | 0.025 |
| 522.857 | 0.028 |
| 523.082 | 0.027 |
| 523.308 | 0.028 |
| 523.533 | 0.025 |
| 523.758 | 0.026 |
| 523.984 | 0.028 |
| 524.209 | 0.028 |
| 524.434 | 0.029 |
| 524.66 | 0.032 |
| 524.885 | 0.035 |
| 525.11 | 0.034 |
| 525.336 | 0.03 |
| 525.561 | 0.029 |
| 525.787 | 0.03 |
| 526.012 | 0.03 |
| 526.238 | 0.032 |
| 526.463 | 0.031 |
| 526.689 | 0.03 |
| 526.914 | 0.031 |
| 527.14 | 0.034 |
| 527.365 | 0.031 |
| 527.591 | 0.034 |
| 527.816 | 0.036 |
| 528.042 | 0.031 |
| 528.267 | 0.033 |
| 528.493 | 0.037 |
| 528.718 | 0.036 |
| 528.944 | 0.035 |
| 529.17 | 0.033 |
| 529.395 | 0.033 |
| 529.621 | 0.032 |
| 529.847 | 0.034 |
| 530.072 | 0.036 |
| 530.298 | 0.037 |
| 530.524 | 0.038 |
| 530.749 | 0.037 |
| 530.975 | 0.033 |
| 531.201 | 0.035 |
| 531.426 | 0.037 |
| 531.652 | 0.037 |
| 531.878 | 0.039 |
| 532.104 | 0.036 |
| 532.33 | 0.036 |
| 532.555 | 0.035 |
| 532.781 | 0.035 |
| 533.007 | 0.039 |
| 533.233 | 0.038 |
| 533.459 | 0.039 |
| 533.685 | 0.04 |
| 533.91 | 0.041 |
| 534.136 | 0.038 |
| 534.362 | 0.04 |
| 534.588 | 0.039 |
| 534.814 | 0.041 |
| 535.04 | 0.036 |
| 535.266 | 0.037 |
| 535.492 | 0.037 |
| 535.718 | 0.043 |
| 535.944 | 0.037 |
| 536.17 | 0.044 |
| 536.396 | 0.039 |
| 536.622 | 0.039 |
| 536.848 | 0.043 |
| 537.074 | 0.038 |
| 537.3 | 0.045 |
| 537.526 | 0.041 |
| 537.752 | 0.04 |
| 537.978 | 0.04 |
| 538.205 | 0.047 |
| 538.431 | 0.048 |
| 538.657 | 0.047 |
| 538.883 | 0.05 |
| 539.109 | 0.042 |
| 539.335 | 0.045 |
| 539.562 | 0.041 |
| 539.788 | 0.047 |
| 540.014 | 0.047 |
| 540.24 | 0.049 |
| 540.466 | 0.049 |
| 540.693 | 0.054 |
| 540.919 | 0.053 |
| 541.145 | 0.053 |
| 541.372 | 0.05 |
| 541.598 | 0.049 |
| 541.824 | 0.047 |
| 542.05 | 0.048 |
| 542.277 | 0.054 |
| 542.503 | 0.057 |
| 542.73 | 0.05 |
| 542.956 | 0.055 |
| 543.182 | 0.054 |
| 543.409 | 0.05 |
| 543.635 | 0.053 |
| 543.862 | 0.054 |
| 544.088 | 0.05 |
| 544.314 | 0.061 |
| 544.541 | 0.051 |
| 544.767 | 0.058 |
| 544.994 | 0.057 |
| 545.22 | 0.058 |
| 545.447 | 0.057 |
| 545.673 | 0.059 |
| 545.9 | 0.052 |
| 546.127 | 0.057 |
| 546.353 | 0.058 |
| 546.58 | 0.063 |
| 546.806 | 0.063 |
| 547.033 | 0.069 |
| 547.26 | 0.066 |
| 547.486 | 0.064 |
| 547.713 | 0.058 |
| 547.939 | 0.064 |
| 548.166 | 0.065 |
| 548.393 | 0.065 |
| 548.619 | 0.064 |
| 548.846 | 0.066 |
| 549.073 | 0.067 |
| 549.3 | 0.065 |
| 549.526 | 0.064 |
| 549.753 | 0.066 |
| 549.98 | 0.067 |
| 550.207 | 0.072 |
| 550.433 | 0.072 |
| 550.66 | 0.073 |
| 550.887 | 0.072 |
| 551.114 | 0.073 |
| 551.341 | 0.071 |
| 551.568 | 0.073 |
| 551.794 | 0.075 |
| 552.021 | 0.076 |
| 552.248 | 0.076 |
| 552.475 | 0.079 |
| 552.702 | 0.078 |
| 552.929 | 0.083 |
| 553.156 | 0.087 |
| 553.383 | 0.082 |
| 553.61 | 0.083 |
| 553.837 | 0.084 |
| 554.064 | 0.085 |
| 554.291 | 0.085 |
| 554.518 | 0.086 |
| 554.745 | 0.09 |
| 554.972 | 0.091 |
| 555.199 | 0.091 |
| 555.426 | 0.093 |
| 555.653 | 0.093 |
| 555.88 | 0.092 |
| 556.107 | 0.092 |
| 556.334 | 0.093 |
| 556.561 | 0.095 |
| 556.788 | 0.097 |
| 557.016 | 0.098 |
| 557.243 | 0.103 |
| 557.47 | 0.104 |
| 557.697 | 0.106 |
| 557.924 | 0.105 |
| 558.152 | 0.105 |
| 558.379 | 0.106 |
| 558.606 | 0.109 |
| 558.833 | 0.108 |
| 559.06 | 0.11 |
| 559.288 | 0.111 |
| 559.515 | 0.112 |
| 559.742 | 0.116 |
| 559.97 | 0.119 |
| 560.197 | 0.119 |
| 560.424 | 0.119 |
| 560.652 | 0.122 |
| 560.879 | 0.121 |
| 561.106 | 0.122 |
| 561.334 | 0.126 |
| 561.561 | 0.127 |
| 561.788 | 0.127 |
| 562.016 | 0.127 |
| 562.243 | 0.131 |
| 562.471 | 0.132 |
| 562.698 | 0.133 |
| 562.926 | 0.138 |
| 563.153 | 0.137 |
| 563.381 | 0.14 |
| 563.608 | 0.141 |
| 563.836 | 0.139 |
| 564.063 | 0.144 |
| 564.291 | 0.145 |
| 564.518 | 0.151 |
| 564.746 | 0.149 |
| 564.973 | 0.156 |
| 565.201 | 0.154 |
| 565.428 | 0.155 |
| 565.656 | 0.158 |
| 565.884 | 0.163 |
| 566.111 | 0.156 |
| 566.339 | 0.166 |
| 566.567 | 0.164 |
| 566.794 | 0.17 |
| 567.022 | 0.169 |
| 567.25 | 0.174 |
| 567.477 | 0.168 |
| 567.705 | 0.177 |
| 567.933 | 0.185 |
| 568.16 | 0.186 |
| 568.388 | 0.19 |
| 568.616 | 0.19 |
| 568.844 | 0.187 |
| 569.072 | 0.196 |
| 569.299 | 0.196 |
| 569.527 | 0.201 |
| 569.755 | 0.198 |
| 569.983 | 0.204 |
| 570.211 | 0.208 |
| 570.438 | 0.208 |
| 570.666 | 0.209 |
| 570.894 | 0.212 |
| 571.122 | 0.21 |
| 571.35 | 0.221 |
| 571.578 | 0.22 |
| 571.806 | 0.223 |
| 572.034 | 0.223 |
| 572.262 | 0.226 |
| 572.49 | 0.23 |
| 572.718 | 0.238 |
| 572.946 | 0.233 |
| 573.174 | 0.237 |
| 573.402 | 0.241 |
| 573.63 | 0.246 |
| 573.858 | 0.247 |
| 574.086 | 0.253 |
| 574.314 | 0.26 |
| 574.542 | 0.26 |
| 574.77 | 0.257 |
| 574.998 | 0.263 |
| 575.226 | 0.265 |
| 575.454 | 0.273 |
| 575.682 | 0.274 |
| 575.911 | 0.281 |
| 576.139 | 0.284 |
| 576.367 | 0.29 |
| 576.595 | 0.29 |
| 576.823 | 0.296 |
| 577.051 | 0.298 |
| 577.28 | 0.306 |
| 577.508 | 0.31 |
| 577.736 | 0.312 |
| 577.964 | 0.316 |
| 578.193 | 0.322 |
| 578.421 | 0.326 |
| 578.649 | 0.327 |
| 578.878 | 0.333 |
| 579.106 | 0.338 |
| 579.334 | 0.343 |
| 579.562 | 0.344 |
| 579.791 | 0.347 |
| 580.019 | 0.352 |
| 580.248 | 0.36 |
| 580.476 | 0.366 |
| 580.704 | 0.369 |
| 580.933 | 0.373 |
| 581.161 | 0.379 |
| 581.39 | 0.381 |
| 581.618 | 0.386 |
| 581.846 | 0.395 |
| 582.075 | 0.401 |
| 582.303 | 0.404 |
| 582.532 | 0.408 |
| 582.76 | 0.414 |
| 582.989 | 0.422 |
| 583.217 | 0.426 |
| 583.446 | 0.431 |
| 583.674 | 0.439 |
| 583.903 | 0.444 |
| 584.132 | 0.449 |
| 584.36 | 0.452 |
| 584.589 | 0.46 |
| 584.817 | 0.472 |
| 585.046 | 0.484 |
| 585.275 | 0.485 |
| 585.503 | 0.49 |
| 585.732 | 0.498 |
| 585.96 | 0.507 |
| 586.189 | 0.51 |
| 586.418 | 0.517 |
| 586.647 | 0.518 |
| 586.875 | 0.526 |
| 587.104 | 0.526 |
| 587.333 | 0.537 |
| 587.561 | 0.545 |
| 587.79 | 0.553 |
| 588.019 | 0.557 |
| 588.248 | 0.565 |
| 588.476 | 0.564 |
| 588.705 | 0.584 |
| 588.934 | 0.589 |
| 589.163 | 0.59 |
| 589.392 | 0.602 |
| 589.621 | 0.613 |
| 589.849 | 0.622 |
| 590.078 | 0.627 |
| 590.307 | 0.636 |
| 590.536 | 0.643 |
| 590.765 | 0.647 |
| 590.994 | 0.662 |
| 591.223 | 0.661 |
| 591.452 | 0.674 |
| 591.681 | 0.68 |
| 591.91 | 0.69 |
| 592.139 | 0.693 |
| 592.368 | 0.708 |
| 592.597 | 0.716 |
| 592.826 | 0.724 |
| 593.055 | 0.724 |
| 593.284 | 0.74 |
| 593.513 | 0.724 |
| 593.742 | 0.747 |
| 593.971 | 0.753 |
| 594.2 | 0.764 |
| 594.429 | 0.768 |
| 594.658 | 0.779 |
| 594.887 | 0.781 |
| 595.116 | 0.796 |
| 595.345 | 0.797 |
| 595.575 | 0.813 |
| 595.804 | 0.818 |
| 596.033 | 0.83 |
| 596.262 | 0.839 |
| 596.491 | 0.849 |
| 596.721 | 0.864 |
| 596.95 | 0.869 |
| 597.179 | 0.877 |
| 597.408 | 0.888 |
| 597.637 | 0.898 |
| 597.867 | 0.907 |
| 598.096 | 0.916 |
| 598.325 | 0.927 |
| 598.555 | 0.934 |
| 598.784 | 0.949 |
| 599.013 | 0.949 |
| 599.242 | 0.963 |
| 599.472 | 0.968 |
| 599.701 | 0.982 |
| 599.931 | 0.993 |
| 600.16 | 1.009 |
| 600.389 | 1.009 |
| 600.619 | 1.021 |
| 600.848 | 1.03 |
| 601.078 | 1.04 |
| 601.307 | 1.048 |
| 601.536 | 1.058 |
| 601.766 | 1.067 |
| 601.995 | 1.08 |
| 602.225 | 1.093 |
| 602.454 | 1.105 |
| 602.684 | 1.113 |
| 602.913 | 1.131 |
| 603.143 | 1.147 |
| 603.372 | 1.159 |
| 603.602 | 1.166 |
| 603.831 | 1.173 |
| 604.061 | 1.186 |
| 604.291 | 1.201 |
| 604.52 | 1.209 |
| 604.75 | 1.217 |
| 604.979 | 1.226 |
| 605.209 | 1.233 |
| 605.439 | 1.246 |
| 605.668 | 1.26 |
| 605.898 | 1.271 |
| 606.128 | 1.277 |
| 606.357 | 1.291 |
| 606.587 | 1.297 |
| 606.817 | 1.308 |
| 607.046 | 1.322 |
| 607.276 | 1.333 |
| 607.506 | 1.339 |
| 607.736 | 1.358 |
| 607.965 | 1.369 |
| 608.195 | 1.377 |
| 608.425 | 1.395 |
| 608.655 | 1.411 |
| 608.885 | 1.415 |
| 609.114 | 1.422 |
| 609.344 | 1.431 |
| 609.574 | 1.443 |
| 609.804 | 1.456 |
| 610.034 | 1.468 |
| 610.264 | 1.476 |
| 610.494 | 1.496 |
| 610.723 | 1.502 |
| 610.953 | 1.517 |
| 611.183 | 1.519 |
| 611.413 | 1.525 |
| 611.643 | 1.534 |
| 611.873 | 1.544 |
| 612.103 | 1.551 |
| 612.333 | 1.572 |
| 612.563 | 1.571 |
| 612.793 | 1.594 |
| 613.023 | 1.599 |
| 613.253 | 1.617 |
| 613.483 | 1.619 |
| 613.713 | 1.636 |
| 613.943 | 1.637 |
| 614.173 | 1.657 |
| 614.403 | 1.654 |
| 614.633 | 1.667 |
| 614.864 | 1.673 |
| 615.094 | 1.695 |
| 615.324 | 1.702 |
| 615.554 | 1.719 |
| 615.784 | 1.716 |
| 616.014 | 1.736 |
| 616.244 | 1.731 |
| 616.475 | 1.753 |
| 616.705 | 1.752 |
| 616.935 | 1.765 |
| 617.165 | 1.771 |
| 617.395 | 1.792 |
| 617.626 | 1.793 |
| 617.856 | 1.813 |
| 618.086 | 1.81 |
| 618.316 | 1.822 |
| 618.547 | 1.826 |
| 618.777 | 1.843 |
| 619.007 | 1.843 |
| 619.237 | 1.858 |
| 619.468 | 1.864 |
| 619.698 | 1.879 |
| 619.928 | 1.89 |
| 620.159 | 1.902 |
| 620.389 | 1.905 |
| 620.62 | 1.92 |
| 620.85 | 1.921 |
| 621.08 | 1.938 |
| 621.311 | 1.945 |
| 621.541 | 1.961 |
| 621.772 | 1.965 |
| 622.002 | 1.979 |
| 622.233 | 1.985 |
| 622.463 | 1.994 |
| 622.693 | 1.995 |
| 622.924 | 2.012 |
| 623.154 | 2.015 |
| 623.385 | 2.025 |
| 623.615 | 2.031 |
| 623.846 | 2.041 |
| 624.077 | 2.046 |
| 624.307 | 2.051 |
| 624.538 | 2.057 |
| 624.768 | 2.076 |
| 624.999 | 2.085 |
| 625.229 | 2.098 |
| 625.46 | 2.105 |
| 625.691 | 2.115 |
| 625.921 | 2.133 |
| 626.152 | 2.144 |
| 626.383 | 2.15 |
| 626.613 | 2.157 |
| 626.844 | 2.167 |
| 627.075 | 2.173 |
| 627.305 | 2.184 |
| 627.536 | 2.192 |
| 627.767 | 2.198 |
| 627.997 | 2.201 |
| 628.228 | 2.211 |
| 628.459 | 2.219 |
| 628.69 | 2.228 |
| 628.92 | 2.24 |
| 629.151 | 2.252 |
| 629.382 | 2.267 |
| 629.613 | 2.275 |
| 629.844 | 2.257 |
| 630.074 | 2.267 |
| 630.305 | 2.279 |
| 630.536 | 2.276 |
| 630.767 | 2.278 |
| 630.998 | 2.285 |
| 631.229 | 2.305 |
| 631.46 | 2.324 |
| 631.691 | 2.323 |
| 631.921 | 2.331 |
| 632.152 | 2.363 |
| 632.383 | 2.337 |
| 632.614 | 2.324 |
| 632.845 | 2.344 |
| 633.076 | 2.349 |
| 633.307 | 2.345 |
| 633.538 | 2.346 |
| 633.769 | 2.335 |
| 634.0 | 2.349 |
| 634.231 | 2.352 |
| 634.462 | 2.368 |
| 634.693 | 2.383 |
| 634.924 | 2.373 |
| 635.155 | 2.368 |
| 635.386 | 2.398 |
| 635.618 | 2.381 |
| 635.849 | 2.362 |
| 636.08 | 2.386 |
| 636.311 | 2.387 |
| 636.542 | 2.375 |
| 636.773 | 2.401 |
| 637.004 | 2.384 |
| 637.235 | 2.388 |
| 637.467 | 2.402 |
| 637.698 | 2.4 |
| 637.929 | 2.385 |
| 638.16 | 2.386 |
| 638.391 | 2.363 |
| 638.623 | 2.386 |
| 638.854 | 2.402 |
| 639.085 | 2.369 |
| 639.316 | 2.404 |
| 639.548 | 2.391 |
| 639.779 | 2.378 |
| 640.01 | 2.372 |
| 640.242 | 2.363 |
| 640.473 | 2.35 |
| 640.704 | 2.37 |
| 640.936 | 2.379 |
| 641.167 | 2.392 |
| 641.398 | 2.374 |
| 641.63 | 2.402 |
| 641.861 | 2.37 |
| 642.092 | 2.354 |
| 642.324 | 2.343 |
| 642.555 | 2.347 |
| 642.787 | 2.358 |
| 643.018 | 2.366 |
| 643.25 | 2.362 |
| 643.481 | 2.342 |
| 643.712 | 2.357 |
| 643.944 | 2.349 |
| 644.175 | 2.356 |
| 644.407 | 2.338 |
| 644.638 | 2.335 |
| 644.87 | 2.359 |
| 645.101 | 2.345 |
| 645.333 | 2.338 |
| 645.564 | 2.337 |
| 645.796 | 2.334 |
| 646.028 | 2.33 |
| 646.259 | 2.33 |
| 646.491 | 2.339 |
| 646.722 | 2.341 |
| 646.954 | 2.335 |
| 647.186 | 2.322 |
| 647.417 | 2.321 |
| 647.649 | 2.317 |
| 647.881 | 2.305 |
| 648.112 | 2.29 |
| 648.344 | 2.266 |
| 648.576 | 2.278 |
| 648.807 | 2.295 |
| 649.039 | 2.305 |
| 649.271 | 2.299 |
| 649.502 | 2.302 |
| 649.734 | 2.302 |
| 649.966 | 2.304 |
| 650.198 | 2.302 |
| 650.429 | 2.297 |
| 650.661 | 2.298 |
| 650.893 | 2.286 |
| 651.125 | 2.293 |
| 651.357 | 2.294 |
| 651.588 | 2.287 |
| 651.82 | 2.307 |
| 652.052 | 2.325 |
| 652.284 | 2.312 |
| 652.516 | 2.315 |
| 652.748 | 2.3 |
| 652.98 | 2.309 |
| 653.212 | 2.329 |
| 653.443 | 2.317 |
| 653.675 | 2.307 |
| 653.907 | 2.279 |
| 654.139 | 2.269 |
| 654.371 | 2.258 |
| 654.603 | 2.246 |
| 654.835 | 2.254 |
| 655.067 | 2.236 |
| 655.299 | 2.237 |
| 655.531 | 2.237 |
| 655.763 | 2.226 |
| 655.995 | 2.23 |
| 656.227 | 2.231 |
| 656.459 | 2.207 |
| 656.691 | 2.223 |
| 656.923 | 2.232 |
| 657.155 | 2.221 |
| 657.388 | 2.168 |
| 657.62 | 2.207 |
| 657.852 | 2.2 |
| 658.084 | 2.18 |
| 658.316 | 2.193 |
| 658.548 | 2.193 |
| 658.78 | 2.173 |
| 659.012 | 2.177 |
| 659.245 | 2.151 |
| 659.477 | 2.164 |
| 659.709 | 2.15 |
| 659.941 | 2.153 |
| 660.173 | 2.166 |
| 660.406 | 2.161 |
| 660.638 | 2.158 |
| 660.87 | 2.156 |
| 661.102 | 2.172 |
| 661.335 | 2.153 |
| 661.567 | 2.14 |
| 661.799 | 2.15 |
| 662.031 | 2.146 |
| 662.264 | 2.137 |
| 662.496 | 2.13 |
| 662.728 | 2.121 |
| 662.961 | 2.122 |
| 663.193 | 2.124 |
| 663.425 | 2.116 |
| 663.658 | 2.12 |
| 663.89 | 2.088 |
| 664.123 | 2.079 |
| 664.355 | 2.067 |
| 664.587 | 2.069 |
| 664.82 | 2.074 |
| 665.052 | 2.073 |
| 665.285 | 2.095 |
| 665.517 | 2.071 |
| 665.75 | 2.07 |
| 665.982 | 2.068 |
| 666.214 | 2.049 |
| 666.447 | 2.037 |
| 666.679 | 2.026 |
| 666.912 | 2.02 |
| 667.144 | 2.017 |
| 667.377 | 2.009 |
| 667.61 | 2.005 |
| 667.842 | 1.998 |
| 668.075 | 1.996 |
| 668.307 | 1.992 |
| 668.54 | 1.977 |
| 668.772 | 1.977 |
| 669.005 | 1.97 |
| 669.238 | 1.967 |
| 669.47 | 1.961 |
| 669.703 | 1.948 |
| 669.936 | 1.937 |
| 670.168 | 1.941 |
| 670.401 | 1.938 |
| 670.634 | 1.926 |
| 670.866 | 1.907 |
| 671.099 | 1.904 |
| 671.332 | 1.899 |
| 671.564 | 1.896 |
| 671.797 | 1.885 |
| 672.03 | 1.885 |
| 672.263 | 1.869 |
| 672.495 | 1.869 |
| 672.728 | 1.865 |
| 672.961 | 1.863 |
| 673.194 | 1.846 |
| 673.426 | 1.847 |
| 673.659 | 1.829 |
| 673.892 | 1.827 |
| 674.125 | 1.813 |
| 674.358 | 1.807 |
| 674.591 | 1.801 |
| 674.823 | 1.801 |
| 675.056 | 1.79 |
| 675.289 | 1.789 |
| 675.522 | 1.779 |
| 675.755 | 1.778 |
| 675.988 | 1.759 |
| 676.221 | 1.757 |
| 676.454 | 1.747 |
| 676.687 | 1.742 |
| 676.92 | 1.731 |
| 677.153 | 1.737 |
| 677.386 | 1.722 |
| 677.619 | 1.72 |
| 677.851 | 1.709 |
| 678.084 | 1.708 |
| 678.317 | 1.696 |
| 678.551 | 1.693 |
| 678.784 | 1.679 |
| 679.017 | 1.68 |
| 679.25 | 1.662 |
| 679.483 | 1.663 |
| 679.716 | 1.645 |
| 679.949 | 1.651 |
| 680.182 | 1.633 |
| 680.415 | 1.632 |
| 680.648 | 1.622 |
| 680.881 | 1.618 |
| 681.114 | 1.604 |
| 681.348 | 1.602 |
| 681.581 | 1.589 |
| 681.814 | 1.592 |
| 682.047 | 1.578 |
| 682.28 | 1.576 |
| 682.513 | 1.568 |
| 682.747 | 1.565 |
| 682.98 | 1.553 |
| 683.213 | 1.551 |
| 683.446 | 1.536 |
| 683.679 | 1.531 |
| 683.913 | 1.525 |
| 684.146 | 1.521 |
| 684.379 | 1.514 |
| 684.613 | 1.51 |
| 684.846 | 1.495 |
| 685.079 | 1.492 |
| 685.312 | 1.482 |
| 685.546 | 1.475 |
| 685.779 | 1.468 |
| 686.012 | 1.462 |
| 686.246 | 1.451 |
| 686.479 | 1.441 |
| 686.713 | 1.434 |
| 686.946 | 1.429 |
| 687.179 | 1.427 |
| 687.413 | 1.421 |
| 687.646 | 1.415 |
| 687.88 | 1.403 |
| 688.113 | 1.395 |
| 688.346 | 1.394 |
| 688.58 | 1.389 |
| 688.813 | 1.381 |
| 689.047 | 1.375 |
| 689.28 | 1.366 |
| 689.514 | 1.357 |
| 689.747 | 1.35 |
| 689.981 | 1.346 |
| 690.214 | 1.34 |
| 690.448 | 1.339 |
| 690.681 | 1.325 |
| 690.915 | 1.32 |
| 691.148 | 1.305 |
| 691.382 | 1.295 |
| 691.616 | 1.287 |
| 691.849 | 1.284 |
| 692.083 | 1.275 |
| 692.316 | 1.275 |
| 692.55 | 1.271 |
| 692.784 | 1.266 |
| 693.017 | 1.25 |
| 693.251 | 1.249 |
| 693.485 | 1.239 |
| 693.718 | 1.238 |
| 693.952 | 1.226 |
| 694.186 | 1.228 |
| 694.419 | 1.209 |
| 694.653 | 1.214 |
| 694.887 | 1.204 |
| 695.12 | 1.203 |
| 695.354 | 1.182 |
| 695.588 | 1.167 |
| 695.822 | 1.169 |
| 696.055 | 1.155 |
| 696.289 | 1.156 |
| 696.523 | 1.131 |
| 696.757 | 1.14 |
| 696.991 | 1.126 |
| 697.224 | 1.128 |
| 697.458 | 1.114 |
| 697.692 | 1.112 |
| 697.926 | 1.11 |
| 698.16 | 1.1 |
| 698.394 | 1.091 |
| 698.627 | 1.092 |
| 698.861 | 1.07 |
| 699.095 | 1.075 |
| 699.329 | 1.061 |
| 699.563 | 1.065 |
| 699.797 | 1.051 |
| 700.031 | 1.053 |
| 700.265 | 1.034 |
| 700.499 | 1.037 |
| 700.733 | 1.028 |
| 700.967 | 1.022 |
| 701.201 | 1.014 |
| 701.435 | 1.018 |
| 701.669 | 1.004 |
| 701.903 | 0.997 |
| 702.137 | 0.987 |
| 702.371 | 0.986 |
| 702.605 | 0.976 |
| 702.839 | 0.971 |
| 703.073 | 0.96 |
| 703.307 | 0.962 |
| 703.541 | 0.951 |
| 703.775 | 0.949 |
| 704.009 | 0.94 |
| 704.243 | 0.937 |
| 704.477 | 0.922 |
| 704.711 | 0.918 |
| 704.946 | 0.91 |
| 705.18 | 0.912 |
| 705.414 | 0.904 |
| 705.648 | 0.9 |
| 705.882 | 0.896 |
| 706.116 | 0.893 |
| 706.351 | 0.884 |
| 706.585 | 0.875 |
| 706.819 | 0.874 |
| 707.053 | 0.873 |
| 707.287 | 0.862 |
| 707.522 | 0.858 |
| 707.756 | 0.856 |
| 707.99 | 0.85 |
| 708.224 | 0.847 |
| 708.459 | 0.842 |
| 708.693 | 0.832 |
| 708.927 | 0.827 |
| 709.162 | 0.82 |
| 709.396 | 0.81 |
| 709.63 | 0.804 |
| 709.865 | 0.794 |
| 710.099 | 0.789 |
| 710.333 | 0.787 |
| 710.568 | 0.79 |
| 710.802 | 0.783 |
| 711.036 | 0.78 |
| 711.271 | 0.771 |
| 711.505 | 0.769 |
| 711.74 | 0.761 |
| 711.974 | 0.759 |
| 712.208 | 0.753 |
| 712.443 | 0.755 |
| 712.677 | 0.742 |
| 712.912 | 0.743 |
| 713.146 | 0.732 |
| 713.381 | 0.728 |
| 713.615 | 0.723 |
| 713.85 | 0.722 |
| 714.084 | 0.712 |
| 714.319 | 0.713 |
| 714.553 | 0.707 |
| 714.788 | 0.708 |
| 715.022 | 0.696 |
| 715.257 | 0.699 |
| 715.491 | 0.692 |
| 715.726 | 0.686 |
| 715.961 | 0.678 |
| 716.195 | 0.674 |
| 716.43 | 0.671 |
| 716.664 | 0.666 |
| 716.899 | 0.66 |
| 717.134 | 0.664 |
| 717.368 | 0.651 |
| 717.603 | 0.661 |
| 717.838 | 0.639 |
| 718.072 | 0.641 |
| 718.307 | 0.635 |
| 718.542 | 0.636 |
| 718.776 | 0.626 |
| 719.011 | 0.626 |
| 719.246 | 0.623 |
| 719.48 | 0.618 |
| 719.715 | 0.608 |
| 719.95 | 0.607 |
| 720.185 | 0.604 |
| 720.419 | 0.601 |
| 720.654 | 0.591 |
| 720.889 | 0.597 |
| 721.124 | 0.589 |
| 721.359 | 0.586 |
| 721.593 | 0.572 |
| 721.828 | 0.575 |
| 722.063 | 0.571 |
| 722.298 | 0.57 |
| 722.533 | 0.564 |
| 722.768 | 0.562 |
| 723.002 | 0.56 |
| 723.237 | 0.555 |
| 723.472 | 0.549 |
| 723.707 | 0.548 |
| 723.942 | 0.543 |
| 724.177 | 0.545 |
| 724.412 | 0.539 |
| 724.647 | 0.534 |
| 724.882 | 0.534 |
| 725.117 | 0.531 |
| 725.352 | 0.523 |
| 725.586 | 0.523 |
| 725.821 | 0.52 |
| 726.056 | 0.516 |
| 726.291 | 0.511 |
| 726.526 | 0.507 |
| 726.761 | 0.505 |
| 726.996 | 0.503 |
| 727.231 | 0.499 |
| 727.467 | 0.498 |
| 727.702 | 0.49 |
| 727.937 | 0.485 |
| 728.172 | 0.483 |
| 728.407 | 0.479 |
| 728.642 | 0.478 |
| 728.877 | 0.477 |
| 729.112 | 0.471 |
| 729.347 | 0.465 |
| 729.582 | 0.463 |
| 729.817 | 0.453 |
| 730.053 | 0.451 |
| 730.288 | 0.453 |
| 730.523 | 0.449 |
| 730.758 | 0.446 |
| 730.993 | 0.447 |
| 731.228 | 0.439 |
| 731.464 | 0.436 |
| 731.699 | 0.43 |
| 731.934 | 0.429 |
| 732.169 | 0.427 |
| 732.404 | 0.422 |
| 732.64 | 0.417 |
| 732.875 | 0.424 |
| 733.11 | 0.415 |
| 733.345 | 0.415 |
| 733.581 | 0.406 |
| 733.816 | 0.407 |
| 734.051 | 0.402 |
| 734.287 | 0.405 |
| 734.522 | 0.397 |
| 734.757 | 0.391 |
| 734.993 | 0.39 |
| 735.228 | 0.388 |
| 735.463 | 0.39 |
| 735.699 | 0.389 |
| 735.934 | 0.383 |
| 736.169 | 0.38 |
| 736.405 | 0.38 |
| 736.64 | 0.373 |
| 736.876 | 0.365 |
| 737.111 | 0.369 |
| 737.346 | 0.365 |
| 737.582 | 0.362 |
| 737.817 | 0.353 |
| 738.053 | 0.362 |
| 738.288 | 0.356 |
| 738.524 | 0.351 |
| 738.759 | 0.347 |
| 738.995 | 0.35 |
| 739.23 | 0.347 |
| 739.466 | 0.343 |
| 739.701 | 0.338 |
| 739.937 | 0.341 |
| 740.172 | 0.335 |
| 740.408 | 0.329 |
| 740.643 | 0.327 |
| 740.879 | 0.323 |
| 741.114 | 0.319 |
| 741.35 | 0.322 |
| 741.586 | 0.32 |
| 741.821 | 0.324 |
| 742.057 | 0.313 |
| 742.292 | 0.311 |
| 742.528 | 0.309 |
| 742.764 | 0.309 |
| 742.999 | 0.303 |
| 743.235 | 0.304 |
| 743.471 | 0.301 |
| 743.706 | 0.3 |
| 743.942 | 0.296 |
| 744.178 | 0.292 |
| 744.413 | 0.287 |
| 744.649 | 0.289 |
| 744.885 | 0.284 |
| 745.12 | 0.28 |
| 745.356 | 0.28 |
| 745.592 | 0.279 |
| 745.828 | 0.275 |
| 746.063 | 0.271 |
| 746.299 | 0.269 |
| 746.535 | 0.27 |
| 746.771 | 0.269 |
| 747.006 | 0.268 |
| 747.242 | 0.263 |
| 747.478 | 0.261 |
| 747.714 | 0.259 |
| 747.95 | 0.258 |
| 748.186 | 0.257 |
| 748.421 | 0.254 |
| 748.657 | 0.251 |
| 748.893 | 0.249 |
| 749.129 | 0.248 |
| 749.365 | 0.246 |
| 749.601 | 0.246 |
| 749.837 | 0.243 |
| 750.073 | 0.242 |
| 750.309 | 0.24 |
| 750.544 | 0.239 |
| 750.78 | 0.235 |
| 751.016 | 0.233 |
| 751.252 | 0.231 |
| 751.488 | 0.231 |
| 751.724 | 0.228 |
| 751.96 | 0.226 |
| 752.196 | 0.223 |
| 752.432 | 0.222 |
| 752.668 | 0.222 |
| 752.904 | 0.222 |
| 753.14 | 0.218 |
| 753.376 | 0.219 |
| 753.612 | 0.216 |
| 753.848 | 0.218 |
| 754.084 | 0.215 |
| 754.32 | 0.212 |
| 754.556 | 0.21 |
| 754.793 | 0.203 |
| 755.029 | 0.203 |
| 755.265 | 0.201 |
| 755.501 | 0.203 |
| 755.737 | 0.199 |
| 755.973 | 0.197 |
| 756.209 | 0.195 |
| 756.445 | 0.199 |
| 756.682 | 0.19 |
| 756.918 | 0.194 |
| 757.154 | 0.19 |
| 757.39 | 0.188 |
| 757.626 | 0.188 |
| 757.862 | 0.187 |
| 758.099 | 0.182 |
| 758.335 | 0.184 |
| 758.571 | 0.185 |
| 758.807 | 0.182 |
| 759.044 | 0.176 |
| 759.28 | 0.179 |
| 759.516 | 0.175 |
| 759.752 | 0.181 |
| 759.989 | 0.171 |
| 760.225 | 0.17 |
| 760.461 | 0.169 |
| 760.697 | 0.167 |
| 760.934 | 0.167 |
| 761.17 | 0.171 |
| 761.406 | 0.166 |
| 761.643 | 0.165 |
| 761.879 | 0.162 |
| 762.115 | 0.161 |
| 762.352 | 0.162 |
| 762.588 | 0.158 |
| 762.825 | 0.159 |
| 763.061 | 0.158 |
| 763.297 | 0.153 |
| 763.534 | 0.157 |
| 763.77 | 0.152 |
| 764.007 | 0.152 |
| 764.243 | 0.152 |
| 764.479 | 0.151 |
| 764.716 | 0.148 |
| 764.952 | 0.146 |
| 765.189 | 0.144 |
| 765.425 | 0.145 |
| 765.662 | 0.143 |
| 765.898 | 0.144 |
| 766.135 | 0.141 |
| 766.371 | 0.142 |
| 766.608 | 0.139 |
| 766.844 | 0.139 |
| 767.081 | 0.138 |
| 767.317 | 0.139 |
| 767.554 | 0.136 |
| 767.791 | 0.135 |
| 768.027 | 0.135 |
| 768.264 | 0.133 |
| 768.5 | 0.132 |
| 768.737 | 0.133 |
| 768.973 | 0.13 |
| 769.21 | 0.129 |
| 769.447 | 0.129 |
| 769.683 | 0.127 |
| 769.92 | 0.127 |
| 770.157 | 0.126 |
| 770.393 | 0.123 |
| 770.63 | 0.123 |
| 770.867 | 0.122 |
| 771.103 | 0.122 |
| 771.34 | 0.121 |
| 771.577 | 0.121 |
| 771.813 | 0.122 |
| 772.05 | 0.119 |
| 772.287 | 0.116 |
| 772.524 | 0.114 |
| 772.76 | 0.116 |
| 772.997 | 0.112 |
| 773.234 | 0.114 |
| 773.471 | 0.104 |
| 773.707 | 0.11 |
| 773.944 | 0.11 |
| 774.181 | 0.11 |
| 774.418 | 0.111 |
| 774.654 | 0.114 |
| 774.891 | 0.106 |
| 775.128 | 0.107 |
| 775.365 | 0.106 |
| 775.602 | 0.108 |
| 775.839 | 0.103 |
| 776.075 | 0.105 |
| 776.312 | 0.104 |
| 776.549 | 0.104 |
| 776.786 | 0.101 |
| 777.023 | 0.106 |
| 777.26 | 0.096 |
| 777.497 | 0.098 |
| 777.734 | 0.101 |
| 777.971 | 0.1 |
| 778.208 | 0.095 |
| 778.444 | 0.092 |
| 778.681 | 0.096 |
| 778.918 | 0.101 |
| 779.155 | 0.094 |
| 779.392 | 0.097 |
| 779.629 | 0.092 |
| 779.866 | 0.099 |
| 780.103 | 0.09 |
| 780.34 | 0.094 |
| 780.577 | 0.089 |
| 780.814 | 0.092 |
| 781.051 | 0.09 |
| 781.288 | 0.087 |
| 781.525 | 0.084 |
| 781.763 | 0.09 |
| 782.0 | 0.089 |
| 782.237 | 0.089 |
| 782.474 | 0.086 |
| 782.711 | 0.087 |
| 782.948 | 0.086 |
| 783.185 | 0.089 |
| 783.422 | 0.082 |
| 783.659 | 0.084 |
| 783.896 | 0.082 |
| 784.134 | 0.08 |
| 784.371 | 0.076 |
| 784.608 | 0.083 |
| 784.845 | 0.083 |
| 785.082 | 0.082 |
| 785.319 | 0.076 |
| 785.557 | 0.075 |
| 785.794 | 0.076 |
| 786.031 | 0.076 |
| 786.268 | 0.075 |
| 786.505 | 0.078 |
| 786.743 | 0.074 |
| 786.98 | 0.073 |
| 787.217 | 0.072 |
| 787.454 | 0.071 |
| 787.692 | 0.072 |
| 787.929 | 0.072 |
| 788.166 | 0.069 |
| 788.404 | 0.068 |
| 788.641 | 0.066 |
| 788.878 | 0.07 |
| 789.115 | 0.07 |
| 789.353 | 0.071 |
| 789.59 | 0.071 |
| 789.827 | 0.069 |
| 790.065 | 0.07 |
| 790.302 | 0.071 |
| 790.539 | 0.067 |
| 790.777 | 0.066 |
| 791.014 | 0.064 |
| 791.252 | 0.065 |
| 791.489 | 0.064 |
| 791.726 | 0.063 |
| 791.964 | 0.068 |
| 792.201 | 0.065 |
| 792.439 | 0.061 |
| 792.676 | 0.064 |
| 792.914 | 0.067 |
| 793.151 | 0.061 |
| 793.388 | 0.063 |
| 793.626 | 0.061 |
| 793.863 | 0.067 |
| 794.101 | 0.062 |
| 794.338 | 0.058 |
| 794.576 | 0.054 |
| 794.813 | 0.057 |
| 795.051 | 0.057 |
| 795.288 | 0.061 |
| 795.526 | 0.061 |
| 795.764 | 0.057 |
| 796.001 | 0.055 |
| 796.239 | 0.05 |
| 796.476 | 0.052 |
| 796.714 | 0.053 |
| 796.951 | 0.056 |
| 797.189 | 0.06 |
| 797.427 | 0.054 |
| 797.664 | 0.05 |
| 797.902 | 0.053 |
| 798.139 | 0.058 |
| 798.377 | 0.054 |
| 798.615 | 0.053 |
| 798.852 | 0.049 |
| 799.09 | 0.051 |
| 799.328 | 0.048 |
| 799.565 | 0.054 |
| 799.803 | 0.045 |
| 800.041 | 0.052 |
| 800.278 | 0.051 |
| 800.516 | 0.049 |
| 800.754 | 0.043 |
| 800.991 | 0.05 |
| 801.229 | 0.047 |
| 801.467 | 0.048 |
| 801.705 | 0.039 |
| 801.942 | 0.045 |
| 802.18 | 0.041 |
| 802.418 | 0.049 |
| 802.656 | 0.04 |
| 802.894 | 0.047 |
| 803.131 | 0.044 |
| 803.369 | 0.042 |
| 803.607 | 0.044 |
| 803.845 | 0.041 |
| 804.083 | 0.046 |
| 804.32 | 0.046 |
| 804.558 | 0.042 |
| 804.796 | 0.044 |
| 805.034 | 0.045 |
| 805.272 | 0.048 |
| 805.51 | 0.038 |
| 805.748 | 0.029 |
| 805.985 | 0.042 |
| 806.223 | 0.046 |
| 806.461 | 0.04 |
| 806.699 | 0.039 |
| 806.937 | 0.041 |
| 807.175 | 0.038 |
| 807.413 | 0.039 |
| 807.651 | 0.039 |
| 807.889 | 0.033 |
| 808.127 | 0.041 |
| 808.365 | 0.039 |
| 808.603 | 0.039 |
| 808.841 | 0.038 |
| 809.079 | 0.04 |
| 809.317 | 0.037 |
| 809.555 | 0.035 |
| 809.793 | 0.031 |
| 810.031 | 0.033 |
| 810.269 | 0.03 |
| 810.507 | 0.033 |
| 810.745 | 0.037 |
| 810.983 | 0.036 |
| 811.221 | 0.031 |
| 811.459 | 0.031 |
| 811.697 | 0.033 |
| 811.935 | 0.03 |
| 812.173 | 0.031 |
| 812.411 | 0.033 |
| 812.649 | 0.032 |
| 812.888 | 0.033 |
| 813.126 | 0.033 |
| 813.364 | 0.03 |
| 813.602 | 0.032 |
| 813.84 | 0.036 |
| 814.078 | 0.033 |
| 814.316 | 0.03 |
| 814.555 | 0.032 |
| 814.793 | 0.033 |
| 815.031 | 0.028 |
| 815.269 | 0.027 |
| 815.507 | 0.028 |
| 815.745 | 0.03 |
| 815.984 | 0.03 |
| 816.222 | 0.035 |
| 816.46 | 0.029 |
| 816.698 | 0.031 |
| 816.937 | 0.03 |
| 817.175 | 0.029 |
| 817.413 | 0.027 |
| 817.651 | 0.026 |
| 817.89 | 0.026 |
| 818.128 | 0.028 |
| 818.366 | 0.028 |
| 818.605 | 0.03 |
| 818.843 | 0.033 |
| 819.081 | 0.035 |
| 819.319 | 0.028 |
| 819.558 | 0.032 |
| 819.796 | 0.026 |
| 820.035 | 0.032 |
| 820.273 | 0.027 |
| 820.511 | 0.03 |
| 820.75 | 0.024 |
| 820.988 | 0.029 |
| 821.226 | 0.024 |
| 821.465 | 0.021 |
| 821.703 | 0.024 |
| 821.942 | 0.027 |
| 822.18 | 0.022 |
| 822.418 | 0.029 |
| 822.657 | 0.024 |
| 822.895 | 0.025 |
| 823.134 | 0.025 |
| 823.372 | 0.023 |
| 823.611 | 0.026 |
| 823.849 | 0.025 |
| 824.088 | 0.018 |
| 824.326 | 0.027 |
| 824.565 | 0.022 |
| 824.803 | 0.025 |
| 825.042 | 0.022 |
| 825.28 | 0.025 |
| 825.519 | 0.025 |
| 825.757 | 0.022 |
| 825.996 | 0.019 |
| 826.234 | 0.021 |
| 826.473 | 0.024 |
| 826.711 | 0.02 |
| 826.95 | 0.021 |
| 827.188 | 0.023 |
| 827.427 | 0.02 |
| 827.666 | 0.024 |
| 827.904 | 0.018 |
| 828.143 | 0.025 |
| 828.381 | 0.025 |
| 828.62 | 0.023 |
| 828.859 | 0.016 |
| 829.097 | 0.02 |
| 829.336 | 0.018 |
| 829.575 | 0.022 |
| 829.813 | 0.02 |
| 830.052 | 0.02 |
| 830.291 | 0.017 |
| 830.529 | 0.02 |
| 830.768 | 0.017 |
| 831.007 | 0.022 |
| 831.245 | 0.021 |
| 831.484 | 0.021 |
| 831.723 | 0.022 |
| 831.961 | 0.021 |
| 832.2 | 0.019 |
| 832.439 | 0.021 |
| 832.678 | 0.019 |
| 832.916 | 0.021 |
| 833.155 | 0.023 |
| 833.394 | 0.02 |
| 833.633 | 0.016 |
| 833.872 | 0.018 |
| 834.11 | 0.021 |
| 834.349 | 0.02 |
| 834.588 | 0.019 |
| 834.827 | 0.02 |
| 835.066 | 0.016 |
| 835.304 | 0.016 |
| 835.543 | 0.017 |
| 835.782 | 0.015 |
| 836.021 | 0.016 |
| 836.26 | 0.018 |
| 836.499 | 0.017 |
| 836.738 | 0.02 |
| 836.976 | 0.02 |
| 837.215 | 0.017 |
| 837.454 | 0.017 |
| 837.693 | 0.017 |
| 837.932 | 0.018 |
| 838.171 | 0.016 |
| 838.41 | 0.017 |
| 838.649 | 0.018 |
| 838.888 | 0.018 |
| 839.127 | 0.016 |
| 839.366 | 0.015 |
| 839.605 | 0.015 |
| 839.844 | 0.017 |
| 840.083 | 0.015 |
| 840.322 | 0.018 |
| 840.561 | 0.015 |
| 840.8 | 0.013 |
| 841.039 | 0.015 |
| 841.278 | 0.02 |
| 841.517 | 0.017 |
| 841.756 | 0.022 |
| 841.995 | 0.016 |
| 842.234 | 0.019 |
| 842.473 | 0.014 |
| 842.712 | 0.016 |
| 842.951 | 0.014 |
| 843.19 | 0.017 |
| 843.429 | 0.015 |
| 843.668 | 0.014 |
| 843.907 | 0.015 |
| 844.146 | 0.018 |
| 844.385 | 0.011 |
| 844.624 | 0.014 |
| 844.864 | 0.014 |
| 845.103 | 0.011 |
| 845.342 | 0.015 |
| 845.581 | 0.016 |
| 845.82 | 0.012 |
| 846.059 | 0.013 |
| 846.298 | 0.011 |
| 846.538 | 0.015 |
| 846.777 | 0.011 |
| 847.016 | 0.01 |
| 847.255 | 0.012 |
| 847.494 | 0.013 |
| 847.734 | 0.008 |
| 847.973 | 0.016 |
| 848.212 | 0.01 |
| 848.451 | 0.01 |
| 848.691 | 0.014 |
| 848.93 | 0.013 |
| 849.169 | 0.011 |
| 849.408 | 0.018 |
| 849.648 | 0.013 |
| 849.887 | 0.014 |
| 850.126 | 0.009 |
| 850.365 | 0.015 |
| 850.605 | 0.008 |
| 850.844 | 0.013 |
| 851.083 | 0.013 |
| 851.323 | 0.013 |
| 851.562 | 0.012 |
| 851.801 | 0.01 |
| 852.041 | 0.013 |
| 852.28 | 0.008 |
| 852.519 | 0.006 |
| 852.759 | 0.011 |
| 852.998 | 0.011 |
| 853.237 | 0.011 |
| 853.477 | 0.015 |
| 853.716 | 0.009 |
| 853.956 | 0.008 |
| 854.195 | 0.012 |
| 854.434 | 0.006 |
| 854.674 | 0.012 |
| 854.913 | 0.014 |
| 855.153 | 0.012 |
| 855.392 | 0.009 |
| 855.632 | 0.011 |
| 855.871 | 0.014 |
| 856.11 | 0.013 |
| 856.35 | 0.01 |
| 856.589 | 0.008 |
| 856.829 | 0.007 |
| 857.068 | 0.008 |
| 857.308 | 0.006 |
| 857.547 | 0.011 |
| 857.787 | 0.011 |
| 858.026 | 0.011 |
| 858.266 | 0.011 |
| 858.505 | 0.007 |
| 858.745 | 0.008 |
| 858.985 | 0.008 |
| 859.224 | 0.006 |
| 859.464 | 0.008 |
| 859.703 | 0.008 |
| 859.943 | 0.007 |
| 860.182 | 0.006 |
| 860.422 | 0.008 |
| 860.662 | 0.01 |
| 860.901 | 0.008 |
| 861.141 | 0.007 |
| 861.38 | 0.012 |
| 861.62 | 0.013 |
| 861.86 | 0.012 |
| 862.099 | 0.01 |
| 862.339 | 0.01 |
| 862.579 | 0.015 |
| 862.818 | 0.012 |
| 863.058 | 0.01 |
| 863.298 | 0.008 |
| 863.537 | 0.004 |
| 863.777 | 0.007 |
| 864.017 | 0.012 |
| 864.256 | 0.01 |
| 864.496 | 0.008 |
| 864.736 | 0.006 |
| 864.975 | 0.009 |
| 865.215 | 0.007 |
| 865.455 | 0.01 |
| 865.695 | 0.012 |
| 865.934 | 0.008 |
| 866.174 | 0.006 |
| 866.414 | 0.015 |
| 866.654 | 0.01 |
| 866.893 | 0.013 |
| 867.133 | 0.007 |
| 867.373 | 0.009 |
| 867.613 | 0.011 |
| 867.853 | 0.01 |
| 868.092 | 0.01 |
| 868.332 | 0.009 |
| 868.572 | 0.007 |
| 868.812 | 0.01 |
| 869.052 | 0.01 |
| 869.292 | 0.014 |
| 869.531 | 0.012 |
| 869.771 | 0.014 |
| 870.011 | 0.008 |
| 870.251 | 0.011 |
| 870.491 | 0.007 |
| 870.731 | 0.008 |
| 870.971 | 0.011 |
| 871.211 | 0.009 |
| 871.45 | 0.003 |
| 871.69 | 0.011 |
| 871.93 | 0.007 |
| 872.17 | 0.005 |
| 872.41 | 0.005 |
| 872.65 | 0.009 |
| 872.89 | 0.011 |
| 873.13 | 0.015 |
| 873.37 | 0.009 |
| 873.61 | 0.014 |
| 873.85 | 0.013 |
| 874.09 | 0.018 |
| 874.33 | 0.005 |
| 874.57 | 0.01 |
| 874.81 | 0.004 |
| 875.05 | 0.013 |
| 875.29 | 0.006 |
| 875.53 | 0.004 |
| 875.77 | 0.013 |
| 876.01 | 0.004 |
| 876.25 | 0.013 |
| 876.49 | 0.012 |
| 876.73 | 0.005 |
| 876.97 | 0.003 |
| 877.21 | 0.011 |
| 877.45 | 0.007 |
| 877.69 | 0.014 |
| 877.93 | 0.013 |
| 878.171 | 0.006 |
| 878.411 | 0.01 |
| 878.651 | 0.012 |
| 878.891 | 0.006 |
| 879.131 | 0.007 |
| 879.371 | 0.002 |
| 879.611 | 0.006 |
| 879.851 | 0.005 |
| 880.091 | 0.007 |
| 880.332 | 0.005 |
| 880.572 | 0.007 |
| 880.812 | 0.003 |
| 881.052 | 0.005 |
| 881.292 | 0.011 |
| 881.533 | 0.008 |
| 881.773 | 0.001 |
| 882.013 | 0.012 |
| 882.253 | 0.01 |
| 882.493 | 0.01 |
| 882.734 | 0.006 |
| 882.974 | 0.007 |
| 883.214 | 0.003 |
| 883.454 | 0.007 |
| 883.695 | 0.005 |
| 883.935 | 0.007 |
| 884.175 | 0.009 |
| 884.415 | 0.013 |
| 884.656 | 0.007 |
| 884.896 | 0.006 |
| 885.136 | 0.003 |
| 885.376 | 0.006 |
| 885.617 | 0.005 |
| 885.857 | 0.007 |
| 886.097 | 0.009 |
| 886.338 | 0.016 |
| 886.578 | 0.015 |
| 886.818 | 0.008 |
| 887.059 | 0.005 |
| 887.299 | 0.011 |
| 887.539 | 0.011 |
| 887.78 | 0.008 |
| 888.02 | 0.008 |
| 888.26 | 0.006 |
| 888.501 | 0.004 |
| 888.741 | 0.009 |
| 888.982 | 0.009 |
| 889.222 | 0.002 |
| 889.462 | 0.001 |
| 889.703 | 0.008 |
| 889.943 | 0.008 |
| 890.184 | 0.004 |
| 890.424 | 0.007 |
| 890.665 | 0.007 |
| 890.905 | 0.011 |
| 891.145 | 0.013 |
| 891.386 | 0.01 |
| 891.626 | 0.003 |
| 891.867 | 0.004 |
| 892.107 | 0.005 |
| 892.348 | 0.002 |
| 892.588 | 0.002 |
| 892.829 | 0.004 |
| 893.069 | 0.003 |
| 893.31 | 0.011 |
| 893.55 | 0.013 |
| 893.791 | 0.008 |
| 894.031 | 0.005 |
| 894.272 | 0.007 |
| 894.512 | 0.005 |
| 894.753 | 0.009 |
| 894.994 | 0.008 |
| 895.234 | 0.007 |
| 895.475 | 0.01 |
| 895.715 | 0.012 |
| 895.956 | 0.004 |
| 896.196 | 0.001 |
| 896.437 | 0.008 |
| 896.678 | 0.009 |
| 896.918 | 0.007 |
| 897.159 | 0.009 |
| 897.399 | 0.003 |
| 897.64 | 0.007 |
| 897.881 | 0.005 |
| 898.121 | 0.008 |
| 898.362 | 0.008 |
| 898.603 | 0.013 |
| 898.843 | 0.014 |
| 899.084 | 0.016 |
| 899.325 | 0.005 |
| 899.565 | 0.015 |
| 899.806 | 0.01 |
| 900.047 | 0.011 |
| 900.287 | 0.007 |
| 900.528 | 0.012 |
| 900.769 | 0.016 |
| 901.009 | 0.015 |
| 901.25 | 0.009 |
| 901.491 | 0.016 |
| 901.732 | 0.011 |
| 901.972 | 0.011 |
| 902.213 | 0.008 |
| 902.454 | 0.023 |
| 902.695 | 0.012 |
| 902.935 | 0.007 |
| 903.176 | 0.012 |
| 903.417 | 0.008 |
| 903.658 | 0.005 |
| 903.898 | 0.017 |
| 904.139 | 0.007 |
| 904.38 | 0.006 |
| 904.621 | -0.003 |
| 904.862 | 0.013 |
| 905.103 | 0.006 |
| 905.343 | 0.011 |
| 905.584 | 0.004 |
| 905.825 | 0.002 |
| 906.066 | 0.002 |
| 906.307 | 0.007 |
| 906.548 | 0.016 |
| 906.788 | 0.018 |
| 907.029 | 0.017 |
| 907.27 | 0.012 |
| 907.511 | 0.001 |
| 907.752 | 0.008 |
| 907.993 | 0.002 |
| 908.234 | 0.009 |
| 908.475 | 0.014 |
| 908.716 | 0.007 |
| 908.956 | 0.009 |
| 909.197 | 0.014 |
| 909.438 | 0.018 |
| 909.679 | 0.014 |
| 909.92 | 0.009 |
| 910.161 | 0.01 |
| 910.402 | 0.002 |
| 910.643 | 0.012 |
| 910.884 | 0.015 |
| 911.125 | 0.011 |
| 911.366 | 0.011 |
| 911.607 | 0.021 |
| 911.848 | 0.002 |
| 912.089 | 0.005 |
| 912.33 | 0.004 |
| 912.571 | 0.007 |
| 912.812 | 0.012 |
| 913.053 | 0.005 |
| 913.294 | 0.011 |
| 913.535 | 0.015 |
| 913.776 | 0.008 |
| 914.017 | 0.006 |
| 914.258 | 0.003 |
| 914.499 | 0.016 |
| 914.74 | 0.016 |
| 914.981 | 0.01 |
| 915.223 | 0.011 |
| 915.464 | 0.007 |
| 915.705 | 0.003 |
| 915.946 | -0.003 |
| 916.187 | 0.009 |
| 916.428 | 0.01 |
| 916.669 | 0.005 |
| 916.91 | 0.007 |
| 917.151 | 0.012 |
| 917.393 | 0.018 |
| 917.634 | 0.007 |
| 917.875 | 0.006 |
| 918.116 | 0.002 |
| 918.357 | 0.008 |
| 918.598 | 0.011 |
| 918.839 | 0.017 |
| 919.081 | 0.017 |
| 919.322 | 0.013 |
| 919.563 | 0.009 |
| 919.804 | 0.009 |
| 920.045 | 0.011 |
| 920.287 | 0.019 |
| 920.528 | 0.015 |
| 920.769 | 0.01 |
| 921.01 | 0.005 |
| 921.251 | 0.003 |
| 921.493 | 0.006 |
| 921.734 | 0.012 |
| 921.975 | 0.009 |
| 922.216 | 0.009 |
| 922.458 | 0.012 |
| 922.699 | 0.012 |
| 922.94 | 0.016 |
| 923.182 | 0.011 |
| 923.423 | 0.006 |
| 923.664 | 0.003 |
| 923.905 | 0 |
| 924.147 | 0.006 |
| 924.388 | 0.011 |
| 924.629 | 0.016 |
| 924.871 | 0.017 |
| 925.112 | 0.017 |
| 925.353 | 0.009 |
| 925.595 | -0.002 |
| 925.836 | 0.005 |
| 926.077 | 0.003 |
| 926.319 | 0.009 |
| 926.56 | 0.02 |
| 926.801 | 0.015 |
| 927.043 | 0.006 |
| 927.284 | 0.007 |
| 927.526 | 0.001 |
| 927.767 | 0.006 |
| 928.008 | 0.007 |
| 928.25 | 0.012 |
| 928.491 | 0.003 |
| 928.733 | 0.01 |
| 928.974 | 0.019 |
| 929.215 | 0.012 |
| 929.457 | 0.002 |
| 929.698 | -0.003 |
| 929.94 | 0 |
| 930.181 | 0.009 |
| 930.423 | 0.005 |
| 930.664 | 0.008 |
| 930.906 | 0.017 |
| 931.147 | 0.006 |
| 931.389 | 0 |
| 931.63 | 0.003 |
| 931.872 | 0.009 |
| 932.113 | 0.009 |
| 932.355 | 0.002 |
| 932.596 | 0.013 |
| 932.838 | 0.01 |
| 933.079 | 0.006 |
| 933.321 | 0.001 |
| 933.562 | 0.008 |
| 933.804 | 0.018 |
| 934.045 | 0.009 |
| 934.287 | 0.013 |
| 934.528 | 0.006 |
| 934.77 | 0.007 |
| 935.011 | 0.008 |
| 935.253 | 0.008 |
| 935.495 | 0.012 |
| 935.736 | 0.006 |
| 935.978 | 0.028 |
| 936.219 | 0.023 |
| 936.461 | 0.02 |
| 936.703 | 0.009 |
| 936.944 | 0.012 |
| 937.186 | 0.01 |
| 937.427 | 0.014 |
| 937.669 | 0.011 |
| 937.911 | -0.003 |
| 938.152 | 0.01 |
| 938.394 | -0.003 |
| 938.636 | 0.006 |
| 938.877 | 0.021 |
| 939.119 | 0.014 |
| 939.361 | 0.006 |
| 939.602 | 0.012 |
| 939.844 | -0.002 |
| 940.086 | 0.005 |
| 940.327 | 0.003 |
| 940.569 | 0.012 |
| 940.811 | 0.017 |
| 941.052 | 0.011 |
| 941.294 | 0.023 |
| 941.536 | 0.015 |
| 941.778 | 0.014 |
| 942.019 | 0.012 |
| 942.261 | -0.003 |
| 942.503 | 0.021 |
| 942.745 | 0.012 |
| 942.986 | 0.005 |
| 943.228 | 0.013 |
| 943.47 | 0.023 |
| 943.712 | 0.019 |
| 943.953 | 0.007 |
| 944.195 | 0.001 |
| 944.437 | 0.011 |
| 944.679 | -0.005 |
| 944.921 | 0.017 |
| 945.162 | 0.009 |
| 945.404 | 0.013 |
| 945.646 | 0.014 |
| 945.888 | 0.023 |
| 946.13 | 0.02 |
| 946.371 | 0.009 |
| 946.613 | 0.004 |
| 946.855 | 0.006 |
| 947.097 | 0.011 |
| 947.339 | 0.037 |
| 947.581 | 0.029 |
| 947.823 | 0.029 |
| 948.064 | 0.012 |
| 948.306 | 0.038 |
| 948.548 | -0.011 |
| 948.79 | 0.008 |
| 949.032 | 0.004 |
| 949.274 | 0.023 |
| 949.516 | 0.004 |
| 949.758 | 0.027 |
| 950.0 | 0.013 |
| 950.242 | 0.015 |
| 950.483 | 0.027 |
| 950.725 | 0.031 |
| 950.967 | 0.007 |
| 951.209 | 0.008 |
| 951.451 | 0.001 |
| 951.693 | 0.009 |
| 951.935 | 0.014 |
| 952.177 | 0.019 |
| 952.419 | 0.007 |
| 952.661 | 0.01 |
| 952.903 | 0.001 |
| 953.145 | 0.016 |
| 953.387 | -0.004 |
| 953.629 | 0.004 |
| 953.871 | -0.001 |
| 954.113 | 0 |
| 954.355 | 0.012 |
| 954.597 | 0.016 |
| 954.839 | 0.003 |
| 955.081 | 0.007 |
| 955.323 | 0.012 |
| 955.565 | 0.015 |
| 955.807 | 0.008 |
| 956.049 | 0.012 |
| 956.291 | 0.002 |
| 956.533 | 0.017 |
| 956.775 | 0.013 |
| 957.018 | 0.021 |
| 957.26 | 0.007 |
| 957.502 | 0.008 |
| 957.744 | 0 |
| 957.986 | 0.012 |
| 958.228 | 0.012 |
| 958.47 | 0.006 |
| 958.712 | 0.005 |
| 958.954 | 0.009 |
| 959.196 | 0.011 |
| 959.439 | 0.022 |
| 959.681 | 0.018 |
| 959.923 | 0.012 |
| 960.165 | 0.023 |
| 960.407 | 0.014 |
| 960.649 | 0.015 |
| 960.891 | 0.017 |
| 961.134 | 0.018 |
| 961.376 | 0.023 |
| 961.618 | 0.007 |
| 961.86 | 0.002 |
| 962.102 | 0.006 |
| 962.345 | 0.012 |
| 962.587 | 0.012 |
| 962.829 | 0.018 |
| 963.071 | 0.007 |
| 963.313 | 0.009 |
| 963.556 | 0.005 |
| 963.798 | 0.006 |
| 964.04 | 0.016 |
| 964.282 | 0.018 |
| 964.524 | 0.011 |
| 964.767 | 0.024 |
| 965.009 | 0.024 |
| 965.251 | 0.013 |
| 965.493 | 0.012 |
| 965.736 | 0.016 |
| 965.978 | 0.021 |
| 966.22 | 0.023 |
| 966.463 | 0.011 |
| 966.705 | 0.008 |
| 966.947 | 0.008 |
| 967.189 | 0.019 |
| 967.432 | 0.025 |
| 967.674 | 0.014 |
| 967.916 | 0.014 |
| 968.159 | 0.02 |
| 968.401 | 0.02 |
| 968.643 | 0.012 |
| 968.886 | 0.002 |
| 969.128 | 0.005 |
| 969.37 | 0.015 |
| 969.613 | 0.018 |
| 969.855 | 0.012 |
| 970.097 | 0.007 |
| 970.34 | 0.014 |
| 970.582 | 0.02 |
| 970.825 | 0.018 |
| 971.067 | 0 |
| 971.309 | 0.011 |
| 971.552 | 0.024 |
| 971.794 | 0.019 |
| 972.037 | 0.015 |
| 972.279 | 0.012 |
| 972.521 | 0.006 |
| 972.764 | 0.022 |
| 973.006 | 0.014 |
| 973.249 | 0.006 |
| 973.491 | 0.012 |
| 973.733 | 0.004 |
| 973.976 | 0 |
| 974.218 | 0.003 |
| 974.461 | 0.011 |
| 974.703 | 0.015 |
| 974.946 | 0.006 |
| 975.188 | 0.014 |
| 975.431 | 0.025 |
| 975.673 | 0.02 |
| 975.916 | 0.005 |
| 976.158 | 0.02 |
| 976.401 | 0.02 |
| 976.643 | 0.01 |
| 976.886 | 0.009 |
| 977.128 | 0.029 |
| 977.371 | 0.034 |
| 977.613 | 0.032 |
| 977.856 | -0.004 |
| 978.098 | 0.002 |
| 978.341 | 0.01 |
| 978.583 | 0.006 |
| 978.826 | 0.015 |
| 979.068 | 0.019 |
| 979.311 | 0.01 |
| 979.553 | 0.036 |
| 979.796 | 0.014 |
| 980.039 | 0.004 |
| 980.281 | 0.002 |
| 980.524 | 0.004 |
| 980.766 | 0.005 |
| 981.009 | 0.01 |
| 981.252 | 0.015 |
| 981.494 | 0.01 |
| 981.737 | -0.001 |
| 981.979 | 0.016 |
| 982.222 | 0.025 |
| 982.465 | 0.022 |
| 982.707 | 0.007 |
| 982.95 | 0.036 |
| 983.192 | 0.011 |
| 983.435 | 0.004 |
| 983.678 | 0.017 |
| 983.92 | 0.024 |
| 984.163 | 0.004 |
| 984.406 | 0.004 |
| 984.648 | 0.011 |
| 984.891 | 0.025 |
| 985.134 | 0.011 |
| 985.376 | 0.007 |
| 985.619 | 0.019 |
| 985.862 | 0.028 |
| 986.104 | 0.01 |
| 986.347 | 0.011 |
| 986.59 | 0.017 |
| 986.833 | 0.024 |
| 987.075 | 0.031 |
| 987.318 | 0.029 |
| 987.561 | 0.031 |
| 987.803 | 0.03 |
| 988.046 | 0.011 |
| 988.289 | 0.012 |
| 988.532 | 0.01 |
| 988.774 | 0.009 |
| 989.017 | 0.011 |
| 989.26 | 0.035 |
| 989.503 | 0.009 |
| 989.745 | 0.016 |
| 989.988 | 0.01 |
| 990.231 | 0.013 |
| 990.474 | 0.009 |
| 990.717 | 0.017 |
| 990.959 | 0.011 |
| 991.202 | 0.011 |
| 991.445 | -0.003 |
| 991.688 | 0.014 |
| 991.931 | 0.032 |
| 992.173 | 0.028 |
| 992.416 | 0.003 |
| 992.659 | 0.033 |
| 992.902 | 0.007 |
| 993.145 | 0.019 |
| 993.388 | 0.013 |
| 993.63 | 0.017 |
| 993.873 | 0 |
| 994.116 | 0.032 |
| 994.359 | 0.006 |
| 994.602 | 0.015 |
| 994.845 | 0.017 |
| 995.088 | 0.015 |
| 995.33 | 0.021 |
| 995.573 | 0.017 |
| 995.816 | 0.008 |
| 996.059 | 0.029 |
| 996.302 | 0 |
| 996.545 | 0.024 |
| 996.788 | 0.024 |
| 997.031 | 0.019 |
| 997.274 | 0.033 |
| 997.517 | 0.015 |
| 997.759 | -0.001 |
| 998.002 | 0.023 |
| 998.245 | 0.048 |
| 998.488 | 0.019 |
| 998.731 | 0.037 |
| 998.974 | 0.029 |
| 999.217 | 0.021 |
| 999.46 | 0.034 |
| 999.703 | 0.015 |
| 999.946 | 0.011 |
| 1000.189 | 0.018 |
| 1000.432 | 0.004 |
| 1000.675 | 0.044 |
| 1000.918 | -0.002 |
| 1001.161 | 0.038 |
| 1001.404 | 0.02 |
| 1001.647 | 0.065 |
| 1001.89 | 0.022 |
| 1002.133 | 0.028 |
| 1002.376 | 0.023 |
| 1002.619 | 0.021 |
| 1002.862 | -0.004 |
| 1003.105 | 0.022 |
| 1003.348 | 0.035 |
| 1003.591 | 0.008 |
| 1003.834 | 0 |
| 1004.077 | 0 |
| 1004.32 | 0 |
| 1004.563 | 0 |
| 1004.806 | 0 |
| 1005.049 | 0 |
| 1005.292 | 0 |
| 1005.536 | 0 |
| 1005.779 | 0 |
| 1006.022 | 0 |
| 1006.265 | 0 |
| 1006.508 | 0 |
| 1006.751 | 0 |
| 1006.994 | 0 |
| 1007.237 | 0 |
| 1007.48 | 0 |
| 1007.723 | 0 |
| 1007.967 | 0 |
| 1008.21 | 0 |
| 1008.453 | 0 |
| 1008.696 | 0 |
| 1008.939 | 0 |
| 1009.182 | 0 |
| 1009.425 | 0 |
| 1009.669 | 0 |
| 1009.912 | 0 |
| 1010.155 | 0 |
| 1010.398 | 0 |
| 1010.641 | 0 |
| 1010.884 | 0 |
| 1011.128 | 0 |
| 1011.371 | 0 |
| 1011.614 | 0 |
| 1011.857 | 0 |
| 1012.1 | 0 |
| 1012.343 | 0 |
| 1012.587 | 0 |
| 1012.83 | 0 |
| 1013.073 | 0 |
| 1013.316 | 0 |
| 1013.56 | 0 |
| 1013.803 | 0 |
| 1014.046 | 0 |
| 1014.289 | 0 |
| 1014.533 | 0 |
| 1014.776 | 0 |
| 1015.019 | 0 |
| 1015.262 | 0 |
| 1015.506 | 0 |
| 1015.749 | 0 |
| 1015.992 | 0 |
| 1016.235 | 0 |
| 1016.479 | 0 |
| 1016.722 | 0 |
| 1016.965 | 0 |
| 1017.208 | 0 |
| 1017.452 | 0 |
| 1017.695 | 0 |
| 1017.938 | 0 |
| 1018.182 | 0 |
| 1018.425 | 0 |
| 1018.668 | 0 |
| 1018.912 | 0 |
| 1019.155 | 0 |
| 1019.398 | 0 |
| 1019.642 | 0 |
| 1019.885 | 0 |
| 1020.128 | 0 |
| 1020.372 | 0 |
| 1020.615 | 0 |
| 1020.858 | 0 |
| 1021.102 | 0 |
| 1021.345 | 0 |
| 1021.588 | 0 |
| 1021.832 | 0 |
| 1022.075 | 0 |
| 1022.319 | 0 |
| 1022.562 | 0 |
| 1022.805 | 0 |
| 1023.049 | 0 |
| 1023.292 | 0 |
| 1023.536 | 0 |
| 1023.779 | 0 |
| 1024.022 | 0 |
| 1024.266 | 0 |
| 1024.509 | 0 |
| 1024.753 | 0 |
| 1024.996 | 0 |
| 1025.24 | 0 |
| 1025.483 | 0 |
| 1025.726 | 0 |
| 1025.97 | 0 |
| 1026.213 | 0 |
| 1026.457 | 0 |
| 1026.7 | 0 |
| 1026.944 | 0 |
| 0.0 | 0 |
| 0.0 | 0 |